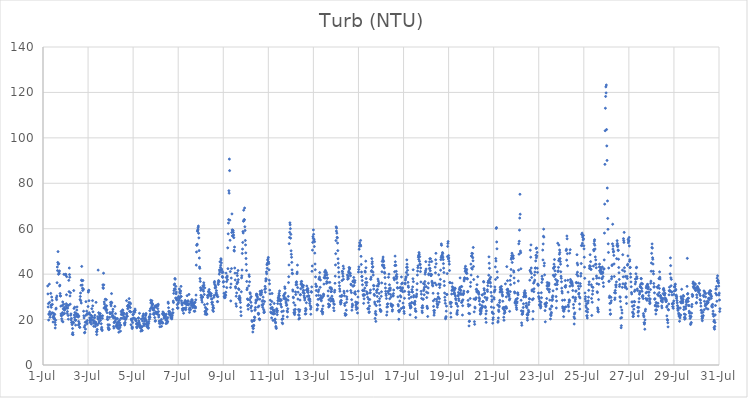
| Category | Turb (NTU) |
|---|---|
| 44378.208333333336 | 34.8 |
| 44378.21875 | 31.29 |
| 44378.229166666664 | 25.55 |
| 44378.239583333336 | 27.02 |
| 44378.25 | 19.78 |
| 44378.260416666664 | 22.27 |
| 44378.270833333336 | 22.65 |
| 44378.28125 | 35.6 |
| 44378.291666666664 | 27.56 |
| 44378.302083333336 | 23.44 |
| 44378.3125 | 21.02 |
| 44378.322916666664 | 22.27 |
| 44378.333333333336 | 22.18 |
| 44378.34375 | 31.53 |
| 44378.354166666664 | 26.29 |
| 44378.364583333336 | 25.41 |
| 44378.375 | 26.37 |
| 44378.385416666664 | 29.91 |
| 44378.395833333336 | 22.83 |
| 44378.40625 | 28.46 |
| 44378.416666666664 | 26.69 |
| 44378.427083333336 | 22.96 |
| 44378.4375 | 21.03 |
| 44378.447916666664 | 18.92 |
| 44378.458333333336 | 21.08 |
| 44378.46875 | 22.72 |
| 44378.479166666664 | 21.85 |
| 44378.489583333336 | 20.97 |
| 44378.5 | 20.44 |
| 44378.510416666664 | 20.25 |
| 44378.520833333336 | 22.32 |
| 44378.53125 | 18.75 |
| 44378.541666666664 | 16.3 |
| 44378.552083333336 | 17.69 |
| 44378.5625 | 19.72 |
| 44378.572916666664 | 24.61 |
| 44378.583333333336 | 25.02 |
| 44378.59375 | 29.55 |
| 44378.604166666664 | 28.76 |
| 44378.614583333336 | 30.36 |
| 44378.625 | 36.23 |
| 44378.635416666664 | 43.13 |
| 44378.645833333336 | 41.56 |
| 44378.65625 | 45.14 |
| 44378.666666666664 | 49.92 |
| 44378.677083333336 | 44.37 |
| 44378.6875 | 39.94 |
| 44378.697916666664 | 44.6 |
| 44378.708333333336 | 40.92 |
| 44378.71875 | 40.28 |
| 44378.729166666664 | 41.4 |
| 44378.739583333336 | 34.79 |
| 44378.75 | 35.16 |
| 44378.760416666664 | 31.47 |
| 44378.770833333336 | 30.39 |
| 44378.78125 | 30.43 |
| 44378.791666666664 | 25.91 |
| 44378.802083333336 | 22.5 |
| 44378.8125 | 21.73 |
| 44378.822916666664 | 21.69 |
| 44378.833333333336 | 20.36 |
| 44378.84375 | 19.43 |
| 44378.854166666664 | 26.18 |
| 44378.864583333336 | 23.06 |
| 44378.875 | 27.76 |
| 44378.885416666664 | 18.99 |
| 44378.895833333336 | 24.69 |
| 44378.90625 | 22.31 |
| 44378.916666666664 | 26.76 |
| 44378.927083333336 | 39.92 |
| 44378.9375 | 25.36 |
| 44378.947916666664 | 24.13 |
| 44378.958333333336 | 22.71 |
| 44378.96875 | 24.73 |
| 44378.979166666664 | 24.59 |
| 44378.989583333336 | 24.68 |
| 44379.0 | 39.63 |
| 44379.010416666664 | 39.96 |
| 44379.020833333336 | 26.01 |
| 44379.03125 | 26.96 |
| 44379.041666666664 | 30.92 |
| 44379.052083333336 | 38.9 |
| 44379.0625 | 25.27 |
| 44379.072916666664 | 22.69 |
| 44379.083333333336 | 23.54 |
| 44379.09375 | 25.02 |
| 44379.104166666664 | 26.34 |
| 44379.114583333336 | 21.8 |
| 44379.125 | 20.18 |
| 44379.135416666664 | 26.22 |
| 44379.145833333336 | 37.27 |
| 44379.15625 | 32.29 |
| 44379.166666666664 | 42.69 |
| 44379.177083333336 | 39.8 |
| 44379.1875 | 38.61 |
| 44379.197916666664 | 30.39 |
| 44379.208333333336 | 26.79 |
| 44379.21875 | 31.79 |
| 44379.229166666664 | 21.95 |
| 44379.239583333336 | 22.51 |
| 44379.25 | 19.78 |
| 44379.260416666664 | 20.54 |
| 44379.270833333336 | 18.64 |
| 44379.28125 | 18.84 |
| 44379.291666666664 | 17.76 |
| 44379.302083333336 | 13.54 |
| 44379.3125 | 16.07 |
| 44379.322916666664 | 14.2 |
| 44379.333333333336 | 13.33 |
| 44379.34375 | 18.87 |
| 44379.354166666664 | 18.56 |
| 44379.364583333336 | 32.77 |
| 44379.375 | 24.91 |
| 44379.385416666664 | 22.01 |
| 44379.395833333336 | 20.9 |
| 44379.40625 | 25.45 |
| 44379.416666666664 | 23.09 |
| 44379.427083333336 | 19.9 |
| 44379.4375 | 19.72 |
| 44379.447916666664 | 17.57 |
| 44379.458333333336 | 19.69 |
| 44379.46875 | 21.41 |
| 44379.479166666664 | 22.37 |
| 44379.489583333336 | 22.61 |
| 44379.5 | 24.18 |
| 44379.510416666664 | 25.57 |
| 44379.520833333336 | 22.24 |
| 44379.53125 | 21.34 |
| 44379.541666666664 | 22.28 |
| 44379.552083333336 | 21.59 |
| 44379.5625 | 21.07 |
| 44379.572916666664 | 17.57 |
| 44379.583333333336 | 19.13 |
| 44379.59375 | 21.54 |
| 44379.604166666664 | 18.01 |
| 44379.614583333336 | 18.33 |
| 44379.625 | 16.65 |
| 44379.635416666664 | 16.56 |
| 44379.645833333336 | 28.82 |
| 44379.65625 | 30.16 |
| 44379.666666666664 | 31.69 |
| 44379.677083333336 | 28.26 |
| 44379.6875 | 35.1 |
| 44379.697916666664 | 27.29 |
| 44379.708333333336 | 37.35 |
| 44379.71875 | 43.41 |
| 44379.729166666664 | 37.06 |
| 44379.739583333336 | 35.2 |
| 44379.75 | 33.78 |
| 44379.760416666664 | 32.8 |
| 44379.770833333336 | 37.22 |
| 44379.78125 | 33.52 |
| 44379.791666666664 | 33.23 |
| 44379.802083333336 | 23.67 |
| 44379.8125 | 21.65 |
| 44379.822916666664 | 20.71 |
| 44379.833333333336 | 16.63 |
| 44379.84375 | 14.18 |
| 44379.854166666664 | 14.37 |
| 44379.864583333336 | 17.42 |
| 44379.875 | 18.79 |
| 44379.885416666664 | 15.8 |
| 44379.895833333336 | 21.84 |
| 44379.90625 | 27.89 |
| 44379.916666666664 | 19.05 |
| 44379.927083333336 | 18.92 |
| 44379.9375 | 23.7 |
| 44379.947916666664 | 22.43 |
| 44379.958333333336 | 18.16 |
| 44379.96875 | 19.58 |
| 44379.979166666664 | 22.58 |
| 44379.989583333336 | 22.42 |
| 44380.0 | 25.74 |
| 44380.010416666664 | 32.09 |
| 44380.020833333336 | 32.68 |
| 44380.03125 | 32.9 |
| 44380.041666666664 | 28.31 |
| 44380.052083333336 | 22.99 |
| 44380.0625 | 22.45 |
| 44380.072916666664 | 20.73 |
| 44380.083333333336 | 18.77 |
| 44380.09375 | 19.83 |
| 44380.104166666664 | 19.79 |
| 44380.114583333336 | 18.94 |
| 44380.125 | 21.87 |
| 44380.135416666664 | 20.66 |
| 44380.145833333336 | 18.01 |
| 44380.15625 | 21.68 |
| 44380.166666666664 | 24.8 |
| 44380.177083333336 | 19.83 |
| 44380.1875 | 21.05 |
| 44380.197916666664 | 28.34 |
| 44380.208333333336 | 26.03 |
| 44380.21875 | 23.43 |
| 44380.229166666664 | 19.63 |
| 44380.239583333336 | 18.5 |
| 44380.25 | 17.06 |
| 44380.260416666664 | 19.1 |
| 44380.270833333336 | 20.88 |
| 44380.28125 | 19.3 |
| 44380.291666666664 | 20.82 |
| 44380.302083333336 | 21.86 |
| 44380.3125 | 18.6 |
| 44380.322916666664 | 16.94 |
| 44380.333333333336 | 17.93 |
| 44380.34375 | 18.85 |
| 44380.354166666664 | 27.58 |
| 44380.364583333336 | 18.18 |
| 44380.375 | 14.63 |
| 44380.385416666664 | 13.4 |
| 44380.395833333336 | 14.85 |
| 44380.40625 | 15.68 |
| 44380.416666666664 | 17.59 |
| 44380.427083333336 | 21.21 |
| 44380.4375 | 20.44 |
| 44380.447916666664 | 41.78 |
| 44380.458333333336 | 20.04 |
| 44380.46875 | 23.02 |
| 44380.479166666664 | 18.36 |
| 44380.489583333336 | 18.96 |
| 44380.5 | 22.48 |
| 44380.510416666664 | 20.73 |
| 44380.520833333336 | 21.75 |
| 44380.53125 | 21.07 |
| 44380.541666666664 | 22.64 |
| 44380.552083333336 | 19.63 |
| 44380.5625 | 20.51 |
| 44380.572916666664 | 21.61 |
| 44380.583333333336 | 18.17 |
| 44380.59375 | 15.79 |
| 44380.604166666664 | 16.59 |
| 44380.614583333336 | 15.6 |
| 44380.625 | 15.17 |
| 44380.635416666664 | 20.57 |
| 44380.645833333336 | 21.69 |
| 44380.65625 | 35.25 |
| 44380.666666666664 | 34.09 |
| 44380.677083333336 | 33.72 |
| 44380.6875 | 40.41 |
| 44380.697916666664 | 35.28 |
| 44380.708333333336 | 25.07 |
| 44380.71875 | 27.77 |
| 44380.729166666664 | 26.82 |
| 44380.739583333336 | 25.01 |
| 44380.75 | 25.49 |
| 44380.760416666664 | 28.97 |
| 44380.770833333336 | 25.8 |
| 44380.78125 | 25.42 |
| 44380.791666666664 | 24.66 |
| 44380.802083333336 | 23.97 |
| 44380.8125 | 28.75 |
| 44380.822916666664 | 26.09 |
| 44380.833333333336 | 24.31 |
| 44380.84375 | 23.04 |
| 44380.854166666664 | 20.16 |
| 44380.864583333336 | 21.12 |
| 44380.875 | 20.01 |
| 44380.885416666664 | 17.74 |
| 44380.895833333336 | 16.55 |
| 44380.90625 | 16 |
| 44380.916666666664 | 15.57 |
| 44380.927083333336 | 16.02 |
| 44380.9375 | 15.73 |
| 44380.947916666664 | 17.63 |
| 44380.958333333336 | 20.96 |
| 44380.96875 | 23.12 |
| 44380.979166666664 | 22.62 |
| 44380.989583333336 | 22.65 |
| 44381.0 | 27.55 |
| 44381.010416666664 | 26.77 |
| 44381.020833333336 | 26.03 |
| 44381.03125 | 27.67 |
| 44381.041666666664 | 31.43 |
| 44381.052083333336 | 27.39 |
| 44381.0625 | 22.79 |
| 44381.072916666664 | 21.3 |
| 44381.083333333336 | 21.85 |
| 44381.09375 | 23.54 |
| 44381.104166666664 | 24.56 |
| 44381.114583333336 | 21.59 |
| 44381.125 | 20.7 |
| 44381.135416666664 | 16.97 |
| 44381.145833333336 | 16.25 |
| 44381.15625 | 18.66 |
| 44381.166666666664 | 20.88 |
| 44381.177083333336 | 19 |
| 44381.1875 | 25.81 |
| 44381.197916666664 | 19.21 |
| 44381.208333333336 | 20.81 |
| 44381.21875 | 22.61 |
| 44381.229166666664 | 20.31 |
| 44381.239583333336 | 20.07 |
| 44381.25 | 17.2 |
| 44381.260416666664 | 16.85 |
| 44381.270833333336 | 17.97 |
| 44381.28125 | 18.49 |
| 44381.291666666664 | 17.37 |
| 44381.302083333336 | 20.47 |
| 44381.3125 | 16.25 |
| 44381.322916666664 | 17.01 |
| 44381.333333333336 | 19.07 |
| 44381.34375 | 18.54 |
| 44381.354166666664 | 16.03 |
| 44381.364583333336 | 14.44 |
| 44381.375 | 17.57 |
| 44381.385416666664 | 16.17 |
| 44381.395833333336 | 19.71 |
| 44381.40625 | 18.57 |
| 44381.416666666664 | 16.67 |
| 44381.427083333336 | 17.55 |
| 44381.4375 | 14.92 |
| 44381.447916666664 | 17.51 |
| 44381.458333333336 | 20.54 |
| 44381.46875 | 23.59 |
| 44381.479166666664 | 22.18 |
| 44381.489583333336 | 22.43 |
| 44381.5 | 23.1 |
| 44381.510416666664 | 20.56 |
| 44381.520833333336 | 22.52 |
| 44381.53125 | 24.25 |
| 44381.541666666664 | 24.04 |
| 44381.552083333336 | 22.05 |
| 44381.5625 | 22.29 |
| 44381.572916666664 | 22.98 |
| 44381.583333333336 | 22.68 |
| 44381.59375 | 21.27 |
| 44381.604166666664 | 20.39 |
| 44381.614583333336 | 18.37 |
| 44381.625 | 17.63 |
| 44381.635416666664 | 18.07 |
| 44381.645833333336 | 18.74 |
| 44381.65625 | 20 |
| 44381.666666666664 | 20.7 |
| 44381.677083333336 | 20.25 |
| 44381.6875 | 20.44 |
| 44381.697916666664 | 22.24 |
| 44381.708333333336 | 28.33 |
| 44381.71875 | 22.75 |
| 44381.729166666664 | 21.48 |
| 44381.739583333336 | 21.48 |
| 44381.75 | 25.9 |
| 44381.760416666664 | 24.74 |
| 44381.770833333336 | 26.13 |
| 44381.78125 | 26.34 |
| 44381.791666666664 | 25.43 |
| 44381.802083333336 | 26.12 |
| 44381.8125 | 27.5 |
| 44381.822916666664 | 29.21 |
| 44381.833333333336 | 25.86 |
| 44381.84375 | 23.63 |
| 44381.854166666664 | 23.61 |
| 44381.864583333336 | 27.4 |
| 44381.875 | 25.27 |
| 44381.885416666664 | 26.94 |
| 44381.895833333336 | 23.33 |
| 44381.90625 | 17.74 |
| 44381.916666666664 | 20.27 |
| 44381.927083333336 | 20 |
| 44381.9375 | 19.53 |
| 44381.947916666664 | 16.71 |
| 44381.958333333336 | 16.06 |
| 44381.96875 | 16.63 |
| 44381.979166666664 | 18.7 |
| 44381.989583333336 | 22.14 |
| 44382.0 | 20.49 |
| 44382.010416666664 | 22.29 |
| 44382.020833333336 | 23.4 |
| 44382.03125 | 20.74 |
| 44382.041666666664 | 23.47 |
| 44382.052083333336 | 23.79 |
| 44382.0625 | 23.63 |
| 44382.072916666664 | 23.18 |
| 44382.083333333336 | 24.65 |
| 44382.09375 | 24.08 |
| 44382.104166666664 | 19.86 |
| 44382.114583333336 | 20.28 |
| 44382.125 | 19.36 |
| 44382.135416666664 | 19.67 |
| 44382.145833333336 | 18.04 |
| 44382.15625 | 16.77 |
| 44382.166666666664 | 16.37 |
| 44382.177083333336 | 18.08 |
| 44382.1875 | 18.25 |
| 44382.197916666664 | 18.47 |
| 44382.208333333336 | 17 |
| 44382.21875 | 17.95 |
| 44382.229166666664 | 20.61 |
| 44382.239583333336 | 20.73 |
| 44382.25 | 17.9 |
| 44382.260416666664 | 19.36 |
| 44382.270833333336 | 18.55 |
| 44382.28125 | 22.75 |
| 44382.291666666664 | 17.84 |
| 44382.302083333336 | 17.12 |
| 44382.3125 | 16.45 |
| 44382.322916666664 | 16.98 |
| 44382.333333333336 | 16.5 |
| 44382.34375 | 14.9 |
| 44382.354166666664 | 16.35 |
| 44382.364583333336 | 20.27 |
| 44382.375 | 15.38 |
| 44382.385416666664 | 16.87 |
| 44382.395833333336 | 16.81 |
| 44382.40625 | 15.16 |
| 44382.416666666664 | 19.39 |
| 44382.427083333336 | 21.54 |
| 44382.4375 | 20.56 |
| 44382.447916666664 | 21.57 |
| 44382.458333333336 | 22.44 |
| 44382.46875 | 18.2 |
| 44382.479166666664 | 17.33 |
| 44382.489583333336 | 17.98 |
| 44382.5 | 20.32 |
| 44382.510416666664 | 19.29 |
| 44382.520833333336 | 20.15 |
| 44382.53125 | 18.01 |
| 44382.541666666664 | 20.65 |
| 44382.552083333336 | 21.72 |
| 44382.5625 | 22.12 |
| 44382.572916666664 | 22.67 |
| 44382.583333333336 | 19.69 |
| 44382.59375 | 17.82 |
| 44382.604166666664 | 16.97 |
| 44382.614583333336 | 18.81 |
| 44382.625 | 18.03 |
| 44382.635416666664 | 16.96 |
| 44382.645833333336 | 16.93 |
| 44382.65625 | 17.44 |
| 44382.666666666664 | 16.21 |
| 44382.677083333336 | 16.4 |
| 44382.6875 | 18.25 |
| 44382.697916666664 | 19.11 |
| 44382.708333333336 | 21.05 |
| 44382.71875 | 20.15 |
| 44382.729166666664 | 21.41 |
| 44382.739583333336 | 23.9 |
| 44382.75 | 20.95 |
| 44382.760416666664 | 22.37 |
| 44382.770833333336 | 24.81 |
| 44382.78125 | 28.51 |
| 44382.791666666664 | 27.26 |
| 44382.802083333336 | 27.61 |
| 44382.8125 | 25.42 |
| 44382.822916666664 | 27.44 |
| 44382.833333333336 | 28.3 |
| 44382.84375 | 26.17 |
| 44382.854166666664 | 26.82 |
| 44382.864583333336 | 26.8 |
| 44382.875 | 24.35 |
| 44382.885416666664 | 24.97 |
| 44382.895833333336 | 25.04 |
| 44382.90625 | 22.35 |
| 44382.916666666664 | 22.83 |
| 44382.927083333336 | 24.08 |
| 44382.9375 | 22.31 |
| 44382.947916666664 | 25.29 |
| 44382.958333333336 | 20.87 |
| 44382.96875 | 25.97 |
| 44382.979166666664 | 19.26 |
| 44382.989583333336 | 19.53 |
| 44383.0 | 23.05 |
| 44383.010416666664 | 23.34 |
| 44383.020833333336 | 25.44 |
| 44383.03125 | 26.29 |
| 44383.041666666664 | 25.9 |
| 44383.052083333336 | 22.62 |
| 44383.0625 | 23.08 |
| 44383.072916666664 | 23.25 |
| 44383.083333333336 | 22.35 |
| 44383.09375 | 24.81 |
| 44383.104166666664 | 26.08 |
| 44383.114583333336 | 26.76 |
| 44383.125 | 23.53 |
| 44383.135416666664 | 21.12 |
| 44383.145833333336 | 22.01 |
| 44383.15625 | 19.32 |
| 44383.166666666664 | 18.3 |
| 44383.177083333336 | 19.08 |
| 44383.1875 | 16.82 |
| 44383.197916666664 | 18.59 |
| 44383.208333333336 | 19.23 |
| 44383.21875 | 18.34 |
| 44383.229166666664 | 19.1 |
| 44383.239583333336 | 19.25 |
| 44383.25 | 20.01 |
| 44383.260416666664 | 17.02 |
| 44383.270833333336 | 18.97 |
| 44383.28125 | 18.68 |
| 44383.291666666664 | 18.86 |
| 44383.302083333336 | 22.54 |
| 44383.3125 | 18.42 |
| 44383.322916666664 | 23.38 |
| 44383.333333333336 | 22.41 |
| 44383.34375 | 22.05 |
| 44383.354166666664 | 22.78 |
| 44383.364583333336 | 20.64 |
| 44383.375 | 22.55 |
| 44383.385416666664 | 21.46 |
| 44383.395833333336 | 20.91 |
| 44383.40625 | 21.67 |
| 44383.416666666664 | 21.39 |
| 44383.427083333336 | 21.88 |
| 44383.4375 | 21.29 |
| 44383.447916666664 | 19.83 |
| 44383.458333333336 | 18.23 |
| 44383.46875 | 22.36 |
| 44383.479166666664 | 20.41 |
| 44383.489583333336 | 19.93 |
| 44383.5 | 18.91 |
| 44383.510416666664 | 18.5 |
| 44383.520833333336 | 19.18 |
| 44383.53125 | 19.12 |
| 44383.541666666664 | 20.87 |
| 44383.552083333336 | 27.68 |
| 44383.5625 | 27.14 |
| 44383.572916666664 | 25.22 |
| 44383.583333333336 | 23.63 |
| 44383.59375 | 22.49 |
| 44383.604166666664 | 23.2 |
| 44383.614583333336 | 22.19 |
| 44383.625 | 23.51 |
| 44383.635416666664 | 22.24 |
| 44383.645833333336 | 22.43 |
| 44383.65625 | 21.74 |
| 44383.666666666664 | 22.44 |
| 44383.677083333336 | 21.06 |
| 44383.6875 | 20.56 |
| 44383.697916666664 | 21.13 |
| 44383.708333333336 | 20.64 |
| 44383.71875 | 20.28 |
| 44383.729166666664 | 21.13 |
| 44383.739583333336 | 21.93 |
| 44383.75 | 22.95 |
| 44383.760416666664 | 24.45 |
| 44383.770833333336 | 22.98 |
| 44383.78125 | 28.14 |
| 44383.791666666664 | 27.48 |
| 44383.802083333336 | 31.54 |
| 44383.8125 | 32.76 |
| 44383.822916666664 | 35.29 |
| 44383.833333333336 | 33.56 |
| 44383.84375 | 35.69 |
| 44383.854166666664 | 38.07 |
| 44383.864583333336 | 37.78 |
| 44383.875 | 33.36 |
| 44383.885416666664 | 29.49 |
| 44383.895833333336 | 34.6 |
| 44383.90625 | 31.34 |
| 44383.916666666664 | 32.11 |
| 44383.927083333336 | 28.91 |
| 44383.9375 | 28.59 |
| 44383.947916666664 | 29.54 |
| 44383.958333333336 | 26.58 |
| 44383.96875 | 25.21 |
| 44383.979166666664 | 24.97 |
| 44383.989583333336 | 25.17 |
| 44384.0 | 27.02 |
| 44384.010416666664 | 27.65 |
| 44384.020833333336 | 30.21 |
| 44384.03125 | 28.47 |
| 44384.041666666664 | 29.56 |
| 44384.052083333336 | 33.45 |
| 44384.0625 | 29.23 |
| 44384.072916666664 | 31.91 |
| 44384.083333333336 | 32.39 |
| 44384.09375 | 31.55 |
| 44384.104166666664 | 32.64 |
| 44384.114583333336 | 30.1 |
| 44384.125 | 34.62 |
| 44384.135416666664 | 30.18 |
| 44384.145833333336 | 28.22 |
| 44384.15625 | 27.34 |
| 44384.166666666664 | 26.88 |
| 44384.177083333336 | 26.41 |
| 44384.1875 | 24.75 |
| 44384.197916666664 | 24.01 |
| 44384.208333333336 | 24.68 |
| 44384.21875 | 24.65 |
| 44384.229166666664 | 24.38 |
| 44384.239583333336 | 22.78 |
| 44384.25 | 24.85 |
| 44384.260416666664 | 24.95 |
| 44384.270833333336 | 27.39 |
| 44384.28125 | 27.33 |
| 44384.291666666664 | 27.79 |
| 44384.302083333336 | 27.2 |
| 44384.3125 | 28.42 |
| 44384.322916666664 | 27.3 |
| 44384.333333333336 | 24.35 |
| 44384.34375 | 25.21 |
| 44384.354166666664 | 26.87 |
| 44384.364583333336 | 26.88 |
| 44384.375 | 26.49 |
| 44384.385416666664 | 27.85 |
| 44384.395833333336 | 30.51 |
| 44384.40625 | 26.88 |
| 44384.416666666664 | 27.85 |
| 44384.427083333336 | 26.73 |
| 44384.4375 | 28.31 |
| 44384.447916666664 | 26.47 |
| 44384.458333333336 | 26.66 |
| 44384.46875 | 26.85 |
| 44384.479166666664 | 31.08 |
| 44384.489583333336 | 24.41 |
| 44384.5 | 23.16 |
| 44384.510416666664 | 24.94 |
| 44384.520833333336 | 25.15 |
| 44384.53125 | 24.22 |
| 44384.541666666664 | 24.55 |
| 44384.552083333336 | 27.86 |
| 44384.5625 | 27.44 |
| 44384.572916666664 | 26.99 |
| 44384.583333333336 | 26.12 |
| 44384.59375 | 27.44 |
| 44384.604166666664 | 28.77 |
| 44384.614583333336 | 27.62 |
| 44384.625 | 28.52 |
| 44384.635416666664 | 26.9 |
| 44384.645833333336 | 25.26 |
| 44384.65625 | 25.69 |
| 44384.666666666664 | 27.4 |
| 44384.677083333336 | 26.22 |
| 44384.6875 | 26.38 |
| 44384.697916666664 | 25.88 |
| 44384.708333333336 | 23.69 |
| 44384.71875 | 27.3 |
| 44384.729166666664 | 25.36 |
| 44384.739583333336 | 23.67 |
| 44384.75 | 27.63 |
| 44384.760416666664 | 25.67 |
| 44384.770833333336 | 25.14 |
| 44384.78125 | 28.68 |
| 44384.791666666664 | 30.78 |
| 44384.802083333336 | 43.97 |
| 44384.8125 | 49.76 |
| 44384.822916666664 | 52.68 |
| 44384.833333333336 | 52.88 |
| 44384.84375 | 53.18 |
| 44384.854166666664 | 58.86 |
| 44384.864583333336 | 59.2 |
| 44384.875 | 59.67 |
| 44384.885416666664 | 60.51 |
| 44384.895833333336 | 61.17 |
| 44384.90625 | 57.99 |
| 44384.916666666664 | 55.96 |
| 44384.927083333336 | 50.36 |
| 44384.9375 | 47.08 |
| 44384.947916666664 | 43.14 |
| 44384.958333333336 | 42.56 |
| 44384.96875 | 38.04 |
| 44384.979166666664 | 36.81 |
| 44384.989583333336 | 34 |
| 44385.0 | 32.89 |
| 44385.010416666664 | 30.7 |
| 44385.020833333336 | 29.71 |
| 44385.03125 | 33.42 |
| 44385.041666666664 | 28.6 |
| 44385.052083333336 | 29.62 |
| 44385.0625 | 27.66 |
| 44385.072916666664 | 30.04 |
| 44385.083333333336 | 29.84 |
| 44385.09375 | 34.82 |
| 44385.104166666664 | 33.2 |
| 44385.114583333336 | 34.41 |
| 44385.125 | 32.49 |
| 44385.135416666664 | 36.19 |
| 44385.145833333336 | 35.17 |
| 44385.15625 | 31.06 |
| 44385.166666666664 | 26.56 |
| 44385.177083333336 | 33.98 |
| 44385.1875 | 23.59 |
| 44385.197916666664 | 22.36 |
| 44385.208333333336 | 25.35 |
| 44385.21875 | 23.26 |
| 44385.229166666664 | 23.73 |
| 44385.239583333336 | 24.81 |
| 44385.25 | 22.39 |
| 44385.260416666664 | 22.61 |
| 44385.270833333336 | 22.3 |
| 44385.28125 | 24.51 |
| 44385.291666666664 | 26.92 |
| 44385.302083333336 | 30.5 |
| 44385.3125 | 29.68 |
| 44385.322916666664 | 30.82 |
| 44385.333333333336 | 30.66 |
| 44385.34375 | 32.4 |
| 44385.354166666664 | 32.24 |
| 44385.364583333336 | 32.09 |
| 44385.375 | 33.21 |
| 44385.385416666664 | 32.12 |
| 44385.395833333336 | 31.59 |
| 44385.40625 | 31.14 |
| 44385.416666666664 | 30.84 |
| 44385.427083333336 | 30.92 |
| 44385.4375 | 30.31 |
| 44385.447916666664 | 30.8 |
| 44385.458333333336 | 30.52 |
| 44385.46875 | 31.43 |
| 44385.479166666664 | 29.03 |
| 44385.489583333336 | 27.52 |
| 44385.5 | 29.13 |
| 44385.510416666664 | 26.72 |
| 44385.520833333336 | 27.66 |
| 44385.53125 | 24.17 |
| 44385.541666666664 | 25.31 |
| 44385.552083333336 | 26.02 |
| 44385.5625 | 23.59 |
| 44385.572916666664 | 25 |
| 44385.583333333336 | 29.8 |
| 44385.59375 | 30.6 |
| 44385.604166666664 | 36.2 |
| 44385.614583333336 | 36.77 |
| 44385.625 | 35.38 |
| 44385.635416666664 | 33.94 |
| 44385.645833333336 | 33.91 |
| 44385.65625 | 34.82 |
| 44385.666666666664 | 34.2 |
| 44385.677083333336 | 31.24 |
| 44385.6875 | 31.85 |
| 44385.697916666664 | 32.74 |
| 44385.708333333336 | 30.62 |
| 44385.71875 | 31.04 |
| 44385.729166666664 | 30.29 |
| 44385.739583333336 | 27.92 |
| 44385.75 | 27.91 |
| 44385.760416666664 | 30.06 |
| 44385.770833333336 | 36.08 |
| 44385.78125 | 35.46 |
| 44385.791666666664 | 37.19 |
| 44385.802083333336 | 36.82 |
| 44385.8125 | 36.77 |
| 44385.822916666664 | 39.99 |
| 44385.833333333336 | 41.83 |
| 44385.84375 | 40.96 |
| 44385.854166666664 | 45.42 |
| 44385.864583333336 | 41.88 |
| 44385.875 | 43 |
| 44385.885416666664 | 43.92 |
| 44385.895833333336 | 46.79 |
| 44385.90625 | 46.23 |
| 44385.916666666664 | 44.95 |
| 44385.927083333336 | 42.23 |
| 44385.9375 | 41.64 |
| 44385.947916666664 | 40.68 |
| 44385.958333333336 | 38.99 |
| 44385.96875 | 38.59 |
| 44385.979166666664 | 38.72 |
| 44385.989583333336 | 40.8 |
| 44386.0 | 36.41 |
| 44386.010416666664 | 36.8 |
| 44386.020833333336 | 34.51 |
| 44386.03125 | 31.6 |
| 44386.041666666664 | 30.09 |
| 44386.052083333336 | 29.64 |
| 44386.0625 | 30.33 |
| 44386.072916666664 | 30.78 |
| 44386.083333333336 | 29.69 |
| 44386.09375 | 30.97 |
| 44386.104166666664 | 30.57 |
| 44386.114583333336 | 32.06 |
| 44386.125 | 40.44 |
| 44386.135416666664 | 38.52 |
| 44386.145833333336 | 36.71 |
| 44386.15625 | 34.07 |
| 44386.166666666664 | 38.65 |
| 44386.177083333336 | 39.15 |
| 44386.1875 | 37.57 |
| 44386.197916666664 | 51.57 |
| 44386.208333333336 | 42.41 |
| 44386.21875 | 57.74 |
| 44386.229166666664 | 62.5 |
| 44386.239583333336 | 64.01 |
| 44386.25 | 76.72 |
| 44386.260416666664 | 75.65 |
| 44386.270833333336 | 90.67 |
| 44386.28125 | 85.58 |
| 44386.291666666664 | 63.75 |
| 44386.302083333336 | 54.92 |
| 44386.3125 | 41.12 |
| 44386.322916666664 | 34.13 |
| 44386.333333333336 | 28.21 |
| 44386.34375 | 35.66 |
| 44386.354166666664 | 38.28 |
| 44386.364583333336 | 42.43 |
| 44386.375 | 58.35 |
| 44386.385416666664 | 66.51 |
| 44386.395833333336 | 59.49 |
| 44386.40625 | 56.88 |
| 44386.416666666664 | 59.31 |
| 44386.427083333336 | 56.77 |
| 44386.4375 | 59.2 |
| 44386.447916666664 | 58.37 |
| 44386.458333333336 | 57.21 |
| 44386.46875 | 56.05 |
| 44386.479166666664 | 50.49 |
| 44386.489583333336 | 50.15 |
| 44386.5 | 51.93 |
| 44386.510416666664 | 42.69 |
| 44386.520833333336 | 40.44 |
| 44386.53125 | 37.45 |
| 44386.541666666664 | 34.48 |
| 44386.552083333336 | 33.92 |
| 44386.5625 | 26.95 |
| 44386.572916666664 | 30.27 |
| 44386.583333333336 | 25.87 |
| 44386.59375 | 31.73 |
| 44386.604166666664 | 35.74 |
| 44386.614583333336 | 40.41 |
| 44386.625 | 39.34 |
| 44386.635416666664 | 36.51 |
| 44386.645833333336 | 36.38 |
| 44386.65625 | 41.59 |
| 44386.666666666664 | 37.58 |
| 44386.677083333336 | 33.6 |
| 44386.6875 | 29.28 |
| 44386.697916666664 | 33.21 |
| 44386.708333333336 | 29.23 |
| 44386.71875 | 30.35 |
| 44386.729166666664 | 28.83 |
| 44386.739583333336 | 28.51 |
| 44386.75 | 29.5 |
| 44386.760416666664 | 27.54 |
| 44386.770833333336 | 25.32 |
| 44386.78125 | 23.45 |
| 44386.791666666664 | 21.73 |
| 44386.802083333336 | 32.23 |
| 44386.8125 | 38.36 |
| 44386.822916666664 | 39.26 |
| 44386.833333333336 | 41.82 |
| 44386.84375 | 49.12 |
| 44386.854166666664 | 51.03 |
| 44386.864583333336 | 53.95 |
| 44386.875 | 58.75 |
| 44386.885416666664 | 58.13 |
| 44386.895833333336 | 63.29 |
| 44386.90625 | 68.15 |
| 44386.916666666664 | 63.5 |
| 44386.927083333336 | 63.95 |
| 44386.9375 | 63.99 |
| 44386.947916666664 | 69.11 |
| 44386.958333333336 | 60.86 |
| 44386.96875 | 59.24 |
| 44386.979166666664 | 54.82 |
| 44386.989583333336 | 52.87 |
| 44387.0 | 49.36 |
| 44387.010416666664 | 46.89 |
| 44387.020833333336 | 44.3 |
| 44387.03125 | 41.63 |
| 44387.041666666664 | 36.78 |
| 44387.052083333336 | 33.15 |
| 44387.0625 | 33.88 |
| 44387.072916666664 | 29.09 |
| 44387.083333333336 | 26.08 |
| 44387.09375 | 28.77 |
| 44387.104166666664 | 24.54 |
| 44387.114583333336 | 26.56 |
| 44387.125 | 26.45 |
| 44387.135416666664 | 34.85 |
| 44387.145833333336 | 39.71 |
| 44387.15625 | 38.96 |
| 44387.166666666664 | 36.63 |
| 44387.177083333336 | 28.57 |
| 44387.1875 | 31.82 |
| 44387.197916666664 | 31.3 |
| 44387.208333333336 | 29.54 |
| 44387.21875 | 25.17 |
| 44387.229166666664 | 27.58 |
| 44387.239583333336 | 30.1 |
| 44387.25 | 25.95 |
| 44387.260416666664 | 23.81 |
| 44387.270833333336 | 19.54 |
| 44387.28125 | 19.15 |
| 44387.291666666664 | 17.07 |
| 44387.302083333336 | 17.01 |
| 44387.3125 | 14.53 |
| 44387.322916666664 | 16.27 |
| 44387.333333333336 | 16.04 |
| 44387.34375 | 17.22 |
| 44387.354166666664 | 17.48 |
| 44387.364583333336 | 19.49 |
| 44387.375 | 19.79 |
| 44387.385416666664 | 21.09 |
| 44387.395833333336 | 20.86 |
| 44387.40625 | 24.06 |
| 44387.416666666664 | 24.4 |
| 44387.427083333336 | 25.32 |
| 44387.4375 | 27.33 |
| 44387.447916666664 | 28.6 |
| 44387.458333333336 | 28.13 |
| 44387.46875 | 31.22 |
| 44387.479166666664 | 30.57 |
| 44387.489583333336 | 30.46 |
| 44387.5 | 31.05 |
| 44387.510416666664 | 28.81 |
| 44387.520833333336 | 29.9 |
| 44387.53125 | 28.95 |
| 44387.541666666664 | 25.5 |
| 44387.552083333336 | 22.76 |
| 44387.5625 | 22.27 |
| 44387.572916666664 | 22.63 |
| 44387.583333333336 | 25.96 |
| 44387.59375 | 20.27 |
| 44387.604166666664 | 20.27 |
| 44387.614583333336 | 19.93 |
| 44387.625 | 28.95 |
| 44387.635416666664 | 32.47 |
| 44387.645833333336 | 31.29 |
| 44387.65625 | 30.84 |
| 44387.666666666664 | 31.94 |
| 44387.677083333336 | 31.44 |
| 44387.6875 | 30.96 |
| 44387.697916666664 | 31.93 |
| 44387.708333333336 | 32.71 |
| 44387.71875 | 26.46 |
| 44387.729166666664 | 28.01 |
| 44387.739583333336 | 26.2 |
| 44387.75 | 25.36 |
| 44387.760416666664 | 28.36 |
| 44387.770833333336 | 29.88 |
| 44387.78125 | 26.87 |
| 44387.791666666664 | 24.42 |
| 44387.802083333336 | 23.07 |
| 44387.8125 | 23.73 |
| 44387.822916666664 | 23.23 |
| 44387.833333333336 | 27.96 |
| 44387.84375 | 33.29 |
| 44387.854166666664 | 34.64 |
| 44387.864583333336 | 32.05 |
| 44387.875 | 33.69 |
| 44387.885416666664 | 37 |
| 44387.895833333336 | 38.01 |
| 44387.90625 | 37.67 |
| 44387.916666666664 | 40.99 |
| 44387.927083333336 | 40.15 |
| 44387.9375 | 44.13 |
| 44387.947916666664 | 42.56 |
| 44387.958333333336 | 44.69 |
| 44387.96875 | 46.24 |
| 44387.979166666664 | 44.98 |
| 44387.989583333336 | 46.64 |
| 44388.0 | 47.36 |
| 44388.010416666664 | 45.4 |
| 44388.020833333336 | 44.65 |
| 44388.03125 | 41.91 |
| 44388.041666666664 | 37.33 |
| 44388.052083333336 | 35.73 |
| 44388.0625 | 32.97 |
| 44388.072916666664 | 31.34 |
| 44388.083333333336 | 28.52 |
| 44388.09375 | 26.64 |
| 44388.104166666664 | 23.29 |
| 44388.114583333336 | 24.89 |
| 44388.125 | 25.17 |
| 44388.135416666664 | 22.82 |
| 44388.145833333336 | 20.74 |
| 44388.15625 | 27.95 |
| 44388.166666666664 | 31.49 |
| 44388.177083333336 | 25.32 |
| 44388.1875 | 22.97 |
| 44388.197916666664 | 24.37 |
| 44388.208333333336 | 19.63 |
| 44388.21875 | 22.45 |
| 44388.229166666664 | 22.65 |
| 44388.239583333336 | 23.87 |
| 44388.25 | 24.21 |
| 44388.260416666664 | 27.09 |
| 44388.270833333336 | 23.65 |
| 44388.28125 | 22.59 |
| 44388.291666666664 | 19.93 |
| 44388.302083333336 | 20.19 |
| 44388.3125 | 18.92 |
| 44388.322916666664 | 18.53 |
| 44388.333333333336 | 16.98 |
| 44388.34375 | 16.48 |
| 44388.354166666664 | 16.09 |
| 44388.364583333336 | 24.26 |
| 44388.375 | 24.76 |
| 44388.385416666664 | 23.21 |
| 44388.395833333336 | 22.16 |
| 44388.40625 | 23.9 |
| 44388.416666666664 | 27.03 |
| 44388.427083333336 | 28.32 |
| 44388.4375 | 29.48 |
| 44388.447916666664 | 29.81 |
| 44388.458333333336 | 28.64 |
| 44388.46875 | 30.68 |
| 44388.479166666664 | 31.55 |
| 44388.489583333336 | 30.5 |
| 44388.5 | 32.58 |
| 44388.510416666664 | 29.08 |
| 44388.520833333336 | 28.19 |
| 44388.53125 | 28.35 |
| 44388.541666666664 | 26.95 |
| 44388.552083333336 | 26.49 |
| 44388.5625 | 28.59 |
| 44388.572916666664 | 28.57 |
| 44388.583333333336 | 25.54 |
| 44388.59375 | 23.48 |
| 44388.604166666664 | 20.09 |
| 44388.614583333336 | 18.58 |
| 44388.625 | 20.28 |
| 44388.635416666664 | 18.19 |
| 44388.645833333336 | 20.33 |
| 44388.65625 | 21.58 |
| 44388.666666666664 | 23.76 |
| 44388.677083333336 | 30.52 |
| 44388.6875 | 29.42 |
| 44388.697916666664 | 30.31 |
| 44388.708333333336 | 31.16 |
| 44388.71875 | 29.11 |
| 44388.729166666664 | 34.39 |
| 44388.739583333336 | 33.71 |
| 44388.75 | 31.72 |
| 44388.760416666664 | 29.43 |
| 44388.770833333336 | 28.88 |
| 44388.78125 | 27.74 |
| 44388.791666666664 | 27.24 |
| 44388.802083333336 | 26.24 |
| 44388.8125 | 28.83 |
| 44388.822916666664 | 26.42 |
| 44388.833333333336 | 23.8 |
| 44388.84375 | 21.17 |
| 44388.854166666664 | 23.35 |
| 44388.864583333336 | 24.77 |
| 44388.875 | 28.53 |
| 44388.885416666664 | 30.21 |
| 44388.895833333336 | 36.28 |
| 44388.90625 | 38.87 |
| 44388.916666666664 | 44.04 |
| 44388.927083333336 | 53.42 |
| 44388.9375 | 56.16 |
| 44388.947916666664 | 58.39 |
| 44388.958333333336 | 62.59 |
| 44388.96875 | 61.71 |
| 44388.979166666664 | 60.03 |
| 44388.989583333336 | 55.83 |
| 44389.0 | 57.53 |
| 44389.010416666664 | 50.28 |
| 44389.020833333336 | 48.73 |
| 44389.03125 | 47.43 |
| 44389.041666666664 | 45.18 |
| 44389.052083333336 | 41.89 |
| 44389.0625 | 40.38 |
| 44389.072916666664 | 40.2 |
| 44389.083333333336 | 33.05 |
| 44389.09375 | 32.5 |
| 44389.104166666664 | 29.89 |
| 44389.114583333336 | 29.59 |
| 44389.125 | 27.43 |
| 44389.135416666664 | 23.07 |
| 44389.145833333336 | 24.28 |
| 44389.15625 | 22.71 |
| 44389.166666666664 | 22.2 |
| 44389.177083333336 | 23.24 |
| 44389.1875 | 26.34 |
| 44389.197916666664 | 24.48 |
| 44389.208333333336 | 32.17 |
| 44389.21875 | 31.03 |
| 44389.229166666664 | 35.26 |
| 44389.239583333336 | 36.22 |
| 44389.25 | 36.65 |
| 44389.260416666664 | 35.43 |
| 44389.270833333336 | 40.19 |
| 44389.28125 | 40.9 |
| 44389.291666666664 | 43.98 |
| 44389.302083333336 | 34.08 |
| 44389.3125 | 29.04 |
| 44389.322916666664 | 32.05 |
| 44389.333333333336 | 24.4 |
| 44389.34375 | 22.1 |
| 44389.354166666664 | 20.2 |
| 44389.364583333336 | 21.88 |
| 44389.375 | 23.47 |
| 44389.385416666664 | 20.63 |
| 44389.395833333336 | 24.29 |
| 44389.40625 | 28.58 |
| 44389.416666666664 | 30.9 |
| 44389.427083333336 | 31.01 |
| 44389.4375 | 33.58 |
| 44389.447916666664 | 35.59 |
| 44389.458333333336 | 36.66 |
| 44389.46875 | 35.85 |
| 44389.479166666664 | 36.82 |
| 44389.489583333336 | 35.5 |
| 44389.5 | 35.17 |
| 44389.510416666664 | 34.68 |
| 44389.520833333336 | 34.48 |
| 44389.53125 | 34.16 |
| 44389.541666666664 | 31.94 |
| 44389.552083333336 | 32.8 |
| 44389.5625 | 35 |
| 44389.572916666664 | 32.8 |
| 44389.583333333336 | 30.51 |
| 44389.59375 | 31.6 |
| 44389.604166666664 | 29.62 |
| 44389.614583333336 | 28.6 |
| 44389.625 | 29.53 |
| 44389.635416666664 | 22.43 |
| 44389.645833333336 | 23.79 |
| 44389.65625 | 24.89 |
| 44389.666666666664 | 22.54 |
| 44389.677083333336 | 24.36 |
| 44389.6875 | 27.41 |
| 44389.697916666664 | 32.97 |
| 44389.708333333336 | 34.77 |
| 44389.71875 | 33.23 |
| 44389.729166666664 | 30.23 |
| 44389.739583333336 | 32.14 |
| 44389.75 | 33.69 |
| 44389.760416666664 | 32.86 |
| 44389.770833333336 | 31.94 |
| 44389.78125 | 30.49 |
| 44389.791666666664 | 28.69 |
| 44389.802083333336 | 30.39 |
| 44389.8125 | 29.28 |
| 44389.822916666664 | 29.15 |
| 44389.833333333336 | 27.1 |
| 44389.84375 | 28.98 |
| 44389.854166666664 | 28.08 |
| 44389.864583333336 | 26.09 |
| 44389.875 | 24.64 |
| 44389.885416666664 | 22.35 |
| 44389.895833333336 | 25.47 |
| 44389.90625 | 32.34 |
| 44389.916666666664 | 32.03 |
| 44389.927083333336 | 34.38 |
| 44389.9375 | 41.25 |
| 44389.947916666664 | 43.59 |
| 44389.958333333336 | 50.56 |
| 44389.96875 | 53.97 |
| 44389.979166666664 | 56.57 |
| 44389.989583333336 | 55.86 |
| 44390.0 | 59.46 |
| 44390.010416666664 | 57.55 |
| 44390.020833333336 | 54.94 |
| 44390.03125 | 55.38 |
| 44390.041666666664 | 52.15 |
| 44390.052083333336 | 54.28 |
| 44390.0625 | 49.26 |
| 44390.072916666664 | 44.47 |
| 44390.083333333336 | 41.93 |
| 44390.09375 | 38.77 |
| 44390.104166666664 | 35.62 |
| 44390.114583333336 | 34.6 |
| 44390.125 | 32.8 |
| 44390.135416666664 | 30.58 |
| 44390.145833333336 | 34.61 |
| 44390.15625 | 24.18 |
| 44390.166666666664 | 26.59 |
| 44390.177083333336 | 24.68 |
| 44390.1875 | 26.47 |
| 44390.197916666664 | 26.29 |
| 44390.208333333336 | 28.89 |
| 44390.21875 | 32.23 |
| 44390.229166666664 | 30.69 |
| 44390.239583333336 | 33.11 |
| 44390.25 | 37.77 |
| 44390.260416666664 | 38.12 |
| 44390.270833333336 | 38.69 |
| 44390.28125 | 40.69 |
| 44390.291666666664 | 29.23 |
| 44390.302083333336 | 34.21 |
| 44390.3125 | 37.43 |
| 44390.322916666664 | 30.5 |
| 44390.333333333336 | 28.67 |
| 44390.34375 | 29.65 |
| 44390.354166666664 | 28.27 |
| 44390.364583333336 | 23.69 |
| 44390.375 | 23.58 |
| 44390.385416666664 | 29.52 |
| 44390.395833333336 | 24.66 |
| 44390.40625 | 22.5 |
| 44390.416666666664 | 23.29 |
| 44390.427083333336 | 26.02 |
| 44390.4375 | 30.23 |
| 44390.447916666664 | 31.22 |
| 44390.458333333336 | 30.86 |
| 44390.46875 | 35.62 |
| 44390.479166666664 | 38.54 |
| 44390.489583333336 | 38.34 |
| 44390.5 | 40.97 |
| 44390.510416666664 | 39.59 |
| 44390.520833333336 | 40.86 |
| 44390.53125 | 41.67 |
| 44390.541666666664 | 39.4 |
| 44390.552083333336 | 38.3 |
| 44390.5625 | 40.46 |
| 44390.572916666664 | 40.83 |
| 44390.583333333336 | 35.94 |
| 44390.59375 | 36.7 |
| 44390.604166666664 | 39.78 |
| 44390.614583333336 | 38.19 |
| 44390.625 | 38.33 |
| 44390.635416666664 | 36.31 |
| 44390.645833333336 | 30.4 |
| 44390.65625 | 32.6 |
| 44390.666666666664 | 26.86 |
| 44390.677083333336 | 25.54 |
| 44390.6875 | 28.69 |
| 44390.697916666664 | 26.43 |
| 44390.708333333336 | 25.87 |
| 44390.71875 | 26.44 |
| 44390.729166666664 | 36.38 |
| 44390.739583333336 | 34.09 |
| 44390.75 | 33.74 |
| 44390.760416666664 | 29.38 |
| 44390.770833333336 | 28.11 |
| 44390.78125 | 32.26 |
| 44390.791666666664 | 33.94 |
| 44390.802083333336 | 32.41 |
| 44390.8125 | 33.36 |
| 44390.822916666664 | 30.32 |
| 44390.833333333336 | 29.1 |
| 44390.84375 | 28.31 |
| 44390.854166666664 | 29.04 |
| 44390.864583333336 | 28.68 |
| 44390.875 | 28.29 |
| 44390.885416666664 | 27.96 |
| 44390.895833333336 | 25.13 |
| 44390.90625 | 26.95 |
| 44390.916666666664 | 23.9 |
| 44390.927083333336 | 26.69 |
| 44390.9375 | 32.09 |
| 44390.947916666664 | 32.9 |
| 44390.958333333336 | 35.97 |
| 44390.96875 | 39.11 |
| 44390.979166666664 | 44.05 |
| 44390.989583333336 | 49.01 |
| 44391.0 | 54.78 |
| 44391.010416666664 | 60.81 |
| 44391.020833333336 | 58.96 |
| 44391.03125 | 60.27 |
| 44391.041666666664 | 58.04 |
| 44391.052083333336 | 56.2 |
| 44391.0625 | 55.97 |
| 44391.072916666664 | 53.69 |
| 44391.083333333336 | 50.35 |
| 44391.09375 | 46.76 |
| 44391.104166666664 | 44.81 |
| 44391.114583333336 | 42.88 |
| 44391.125 | 40.82 |
| 44391.135416666664 | 38.74 |
| 44391.145833333336 | 36.31 |
| 44391.15625 | 34.84 |
| 44391.166666666664 | 33.49 |
| 44391.177083333336 | 32.49 |
| 44391.1875 | 30.26 |
| 44391.197916666664 | 27.66 |
| 44391.208333333336 | 26.84 |
| 44391.21875 | 28.27 |
| 44391.229166666664 | 27.4 |
| 44391.239583333336 | 28.4 |
| 44391.25 | 30.2 |
| 44391.260416666664 | 30.65 |
| 44391.270833333336 | 37.19 |
| 44391.28125 | 41.29 |
| 44391.291666666664 | 41.06 |
| 44391.302083333336 | 40.2 |
| 44391.3125 | 39.06 |
| 44391.322916666664 | 43.53 |
| 44391.333333333336 | 37.75 |
| 44391.34375 | 42.47 |
| 44391.354166666664 | 32.49 |
| 44391.364583333336 | 31.68 |
| 44391.375 | 30.49 |
| 44391.385416666664 | 26.99 |
| 44391.395833333336 | 26.2 |
| 44391.40625 | 22.65 |
| 44391.416666666664 | 21.85 |
| 44391.427083333336 | 22.12 |
| 44391.4375 | 22.21 |
| 44391.447916666664 | 22.08 |
| 44391.458333333336 | 24.13 |
| 44391.46875 | 27.57 |
| 44391.479166666664 | 30.01 |
| 44391.489583333336 | 28.99 |
| 44391.5 | 32.55 |
| 44391.510416666664 | 39.62 |
| 44391.520833333336 | 37.76 |
| 44391.53125 | 38.61 |
| 44391.541666666664 | 39 |
| 44391.552083333336 | 38.07 |
| 44391.5625 | 40.88 |
| 44391.572916666664 | 41.36 |
| 44391.583333333336 | 42.91 |
| 44391.59375 | 40.51 |
| 44391.604166666664 | 42.25 |
| 44391.614583333336 | 42.74 |
| 44391.625 | 40.16 |
| 44391.635416666664 | 40.45 |
| 44391.645833333336 | 39.29 |
| 44391.65625 | 32.77 |
| 44391.666666666664 | 35.6 |
| 44391.677083333336 | 35.27 |
| 44391.6875 | 31.86 |
| 44391.697916666664 | 28.76 |
| 44391.708333333336 | 24.11 |
| 44391.71875 | 25.54 |
| 44391.729166666664 | 26.83 |
| 44391.739583333336 | 26.24 |
| 44391.75 | 36.79 |
| 44391.760416666664 | 34.64 |
| 44391.770833333336 | 37.12 |
| 44391.78125 | 36.62 |
| 44391.791666666664 | 38.54 |
| 44391.802083333336 | 34.98 |
| 44391.8125 | 37.12 |
| 44391.822916666664 | 31.63 |
| 44391.833333333336 | 36.29 |
| 44391.84375 | 37.13 |
| 44391.854166666664 | 32.25 |
| 44391.864583333336 | 31.17 |
| 44391.875 | 27.69 |
| 44391.885416666664 | 26.37 |
| 44391.895833333336 | 25.5 |
| 44391.90625 | 24.45 |
| 44391.916666666664 | 27.52 |
| 44391.927083333336 | 26.91 |
| 44391.9375 | 25.13 |
| 44391.947916666664 | 25.01 |
| 44391.958333333336 | 22.91 |
| 44391.96875 | 27.39 |
| 44391.979166666664 | 29.91 |
| 44391.989583333336 | 32.52 |
| 44392.0 | 40.93 |
| 44392.010416666664 | 42.08 |
| 44392.020833333336 | 43.2 |
| 44392.03125 | 50.98 |
| 44392.041666666664 | 52.31 |
| 44392.052083333336 | 53.79 |
| 44392.0625 | 52.54 |
| 44392.072916666664 | 52.84 |
| 44392.083333333336 | 52.91 |
| 44392.09375 | 54.84 |
| 44392.104166666664 | 52.37 |
| 44392.114583333336 | 47.83 |
| 44392.125 | 44.27 |
| 44392.135416666664 | 40.94 |
| 44392.145833333336 | 38.89 |
| 44392.15625 | 38.96 |
| 44392.166666666664 | 37.18 |
| 44392.177083333336 | 35.32 |
| 44392.1875 | 32.9 |
| 44392.197916666664 | 32.71 |
| 44392.208333333336 | 30.94 |
| 44392.21875 | 30.51 |
| 44392.229166666664 | 27.14 |
| 44392.239583333336 | 30.99 |
| 44392.25 | 29.13 |
| 44392.260416666664 | 32.75 |
| 44392.270833333336 | 30.81 |
| 44392.28125 | 33.85 |
| 44392.291666666664 | 41.31 |
| 44392.302083333336 | 40.91 |
| 44392.3125 | 36.28 |
| 44392.322916666664 | 45.72 |
| 44392.333333333336 | 42.82 |
| 44392.34375 | 38.04 |
| 44392.354166666664 | 35.11 |
| 44392.364583333336 | 32.22 |
| 44392.375 | 36.34 |
| 44392.385416666664 | 31.26 |
| 44392.395833333336 | 31.56 |
| 44392.40625 | 29.8 |
| 44392.416666666664 | 24.75 |
| 44392.427083333336 | 24.83 |
| 44392.4375 | 27.45 |
| 44392.447916666664 | 28.95 |
| 44392.458333333336 | 24.76 |
| 44392.46875 | 23.1 |
| 44392.479166666664 | 23.44 |
| 44392.489583333336 | 25.94 |
| 44392.5 | 28.85 |
| 44392.510416666664 | 31.77 |
| 44392.520833333336 | 31.79 |
| 44392.53125 | 32.99 |
| 44392.541666666664 | 37.8 |
| 44392.552083333336 | 37.77 |
| 44392.5625 | 38.7 |
| 44392.572916666664 | 41.19 |
| 44392.583333333336 | 41.55 |
| 44392.59375 | 46.85 |
| 44392.604166666664 | 44.6 |
| 44392.614583333336 | 45.45 |
| 44392.625 | 43.05 |
| 44392.635416666664 | 43.32 |
| 44392.645833333336 | 40.89 |
| 44392.65625 | 39.61 |
| 44392.666666666664 | 35.03 |
| 44392.677083333336 | 33.41 |
| 44392.6875 | 34.85 |
| 44392.697916666664 | 31.13 |
| 44392.708333333336 | 30.63 |
| 44392.71875 | 27.71 |
| 44392.729166666664 | 26.89 |
| 44392.739583333336 | 20.5 |
| 44392.75 | 22.73 |
| 44392.760416666664 | 23.58 |
| 44392.770833333336 | 19.2 |
| 44392.78125 | 22.1 |
| 44392.791666666664 | 26.16 |
| 44392.802083333336 | 32.73 |
| 44392.8125 | 31.93 |
| 44392.822916666664 | 34.84 |
| 44392.833333333336 | 30.19 |
| 44392.84375 | 33.27 |
| 44392.854166666664 | 28 |
| 44392.864583333336 | 37.83 |
| 44392.875 | 34.75 |
| 44392.885416666664 | 36.93 |
| 44392.895833333336 | 35.61 |
| 44392.90625 | 35.98 |
| 44392.916666666664 | 31.52 |
| 44392.927083333336 | 28.05 |
| 44392.9375 | 29.2 |
| 44392.947916666664 | 26.37 |
| 44392.958333333336 | 24.5 |
| 44392.96875 | 24.22 |
| 44392.979166666664 | 23.96 |
| 44392.989583333336 | 23.54 |
| 44393.0 | 23.85 |
| 44393.010416666664 | 30.26 |
| 44393.020833333336 | 32.24 |
| 44393.03125 | 36.15 |
| 44393.041666666664 | 41.05 |
| 44393.052083333336 | 45.62 |
| 44393.0625 | 44.04 |
| 44393.072916666664 | 43.71 |
| 44393.083333333336 | 46.62 |
| 44393.09375 | 47.53 |
| 44393.104166666664 | 45.82 |
| 44393.114583333336 | 45.58 |
| 44393.125 | 43.94 |
| 44393.135416666664 | 42.97 |
| 44393.145833333336 | 42.72 |
| 44393.15625 | 40.79 |
| 44393.166666666664 | 40.38 |
| 44393.177083333336 | 38.49 |
| 44393.1875 | 35.72 |
| 44393.197916666664 | 33.93 |
| 44393.208333333336 | 32.43 |
| 44393.21875 | 31.35 |
| 44393.229166666664 | 30.61 |
| 44393.239583333336 | 29.27 |
| 44393.25 | 21.97 |
| 44393.260416666664 | 25.49 |
| 44393.270833333336 | 23.37 |
| 44393.28125 | 26.76 |
| 44393.291666666664 | 25.64 |
| 44393.302083333336 | 26.94 |
| 44393.3125 | 32.35 |
| 44393.322916666664 | 32.32 |
| 44393.333333333336 | 38.62 |
| 44393.34375 | 31.4 |
| 44393.354166666664 | 40 |
| 44393.364583333336 | 33.63 |
| 44393.375 | 35.31 |
| 44393.385416666664 | 29.17 |
| 44393.395833333336 | 32.93 |
| 44393.40625 | 33.04 |
| 44393.416666666664 | 33.86 |
| 44393.427083333336 | 31.03 |
| 44393.4375 | 26.92 |
| 44393.447916666664 | 29.95 |
| 44393.458333333336 | 26.12 |
| 44393.46875 | 26.64 |
| 44393.479166666664 | 26.31 |
| 44393.489583333336 | 25.71 |
| 44393.5 | 23.72 |
| 44393.510416666664 | 24.33 |
| 44393.520833333336 | 26.29 |
| 44393.53125 | 30.55 |
| 44393.541666666664 | 30.39 |
| 44393.552083333336 | 31.44 |
| 44393.5625 | 33.01 |
| 44393.572916666664 | 38.38 |
| 44393.583333333336 | 38.03 |
| 44393.59375 | 37.5 |
| 44393.604166666664 | 41.05 |
| 44393.614583333336 | 43.8 |
| 44393.625 | 47.94 |
| 44393.635416666664 | 45.44 |
| 44393.645833333336 | 43.88 |
| 44393.65625 | 43.86 |
| 44393.666666666664 | 39.06 |
| 44393.677083333336 | 41.24 |
| 44393.6875 | 37.95 |
| 44393.697916666664 | 39.87 |
| 44393.708333333336 | 38.8 |
| 44393.71875 | 36.19 |
| 44393.729166666664 | 34.08 |
| 44393.739583333336 | 33.85 |
| 44393.75 | 29.99 |
| 44393.760416666664 | 26.61 |
| 44393.770833333336 | 26 |
| 44393.78125 | 23.9 |
| 44393.791666666664 | 20.16 |
| 44393.802083333336 | 23.37 |
| 44393.8125 | 23.99 |
| 44393.822916666664 | 23.93 |
| 44393.83347222222 | 28.16 |
| 44393.84375 | 33.99 |
| 44393.854166666664 | 30.51 |
| 44393.864583333336 | 34.2 |
| 44393.875 | 32.76 |
| 44393.885416666664 | 29.94 |
| 44393.895833333336 | 24.87 |
| 44393.90625 | 38.76 |
| 44393.916666666664 | 35.73 |
| 44393.927083333336 | 32.66 |
| 44393.9375 | 33.51 |
| 44393.947916666664 | 36.09 |
| 44393.958333333336 | 33.96 |
| 44393.96875 | 32.27 |
| 44393.979166666664 | 27.26 |
| 44393.989583333336 | 25.11 |
| 44394.0 | 25.6 |
| 44394.010416666664 | 25.15 |
| 44394.020833333336 | 23.59 |
| 44394.03125 | 22.72 |
| 44394.041666666664 | 29.36 |
| 44394.052083333336 | 32.46 |
| 44394.0625 | 36 |
| 44394.072916666664 | 35.71 |
| 44394.083333333336 | 37.36 |
| 44394.09375 | 37.96 |
| 44394.104166666664 | 38.79 |
| 44394.114583333336 | 38.7 |
| 44394.125 | 40.73 |
| 44394.135416666664 | 42.99 |
| 44394.145833333336 | 46.28 |
| 44394.15625 | 44.38 |
| 44394.166666666664 | 43.04 |
| 44394.177083333336 | 41.69 |
| 44394.1875 | 39.74 |
| 44394.197916666664 | 36.38 |
| 44394.208333333336 | 34.79 |
| 44394.21875 | 34.2 |
| 44394.229166666664 | 32.18 |
| 44394.239583333336 | 30.98 |
| 44394.25 | 29.32 |
| 44394.260416666664 | 32.02 |
| 44394.270833333336 | 26.95 |
| 44394.28125 | 26.13 |
| 44394.291666666664 | 22.1 |
| 44394.302083333336 | 25.09 |
| 44394.3125 | 25.82 |
| 44394.322916666664 | 25.87 |
| 44394.333333333336 | 25.37 |
| 44394.34375 | 29.92 |
| 44394.354166666664 | 27.21 |
| 44394.364583333336 | 27.55 |
| 44394.375 | 33.19 |
| 44394.385416666664 | 32.22 |
| 44394.395833333336 | 32.13 |
| 44394.40625 | 34.39 |
| 44394.416666666664 | 37.98 |
| 44394.427083333336 | 41.93 |
| 44394.4375 | 36.7 |
| 44394.447916666664 | 29.92 |
| 44394.458333333336 | 30.59 |
| 44394.46875 | 27.34 |
| 44394.479166666664 | 27.04 |
| 44394.489583333336 | 27.32 |
| 44394.5 | 26.65 |
| 44394.510416666664 | 28.07 |
| 44394.520833333336 | 24.73 |
| 44394.53125 | 23.79 |
| 44394.541666666664 | 20.92 |
| 44394.552083333336 | 23.6 |
| 44394.5625 | 29.94 |
| 44394.572916666664 | 30.36 |
| 44394.583333333336 | 31.23 |
| 44394.59375 | 33.06 |
| 44394.604166666664 | 35.82 |
| 44394.614583333336 | 39.6 |
| 44394.625 | 41.37 |
| 44394.635416666664 | 42.83 |
| 44394.645833333336 | 43.69 |
| 44394.65625 | 47.49 |
| 44394.666666666664 | 48.21 |
| 44394.677083333336 | 46.51 |
| 44394.6875 | 49.5 |
| 44394.697916666664 | 48.79 |
| 44394.708333333336 | 45.66 |
| 44394.71875 | 47.69 |
| 44394.729166666664 | 44.49 |
| 44394.739583333336 | 44.19 |
| 44394.75 | 41.13 |
| 44394.760416666664 | 42.73 |
| 44394.770833333336 | 36.55 |
| 44394.78125 | 32.44 |
| 44394.791666666664 | 31.18 |
| 44394.802083333336 | 29.32 |
| 44394.8125 | 25.28 |
| 44394.822916666664 | 23.79 |
| 44394.833333333336 | 23.05 |
| 44394.84375 | 26.13 |
| 44394.854166666664 | 25.25 |
| 44394.864583333336 | 28.9 |
| 44394.875 | 29.01 |
| 44394.885416666664 | 35.88 |
| 44394.895833333336 | 32.78 |
| 44394.90625 | 33.36 |
| 44394.916666666664 | 30.91 |
| 44394.927083333336 | 34.21 |
| 44394.9375 | 35.46 |
| 44394.947916666664 | 36.74 |
| 44394.958333333336 | 39.98 |
| 44394.96875 | 40.78 |
| 44394.979166666664 | 41.47 |
| 44394.989583333336 | 45.5 |
| 44395.0 | 42.25 |
| 44395.010416666664 | 34.53 |
| 44395.020833333336 | 32.05 |
| 44395.03125 | 29.69 |
| 44395.041666666664 | 25.87 |
| 44395.052083333336 | 25.14 |
| 44395.0625 | 24.9 |
| 44395.072916666664 | 21.37 |
| 44395.083333333336 | 31.71 |
| 44395.09375 | 33.92 |
| 44395.104166666664 | 36 |
| 44395.114583333336 | 39.75 |
| 44395.125 | 40.18 |
| 44395.135416666664 | 44.02 |
| 44395.145833333336 | 42.45 |
| 44395.15625 | 45.39 |
| 44395.166666666664 | 46.79 |
| 44395.177083333336 | 42.55 |
| 44395.1875 | 41.49 |
| 44395.197916666664 | 46.8 |
| 44395.208333333336 | 39.76 |
| 44395.21875 | 39.3 |
| 44395.229166666664 | 39.87 |
| 44395.239583333336 | 39.83 |
| 44395.25 | 45.58 |
| 44395.260416666664 | 36.89 |
| 44395.270833333336 | 36.34 |
| 44395.28125 | 35.19 |
| 44395.291666666664 | 35.94 |
| 44395.302083333336 | 34.79 |
| 44395.3125 | 31.59 |
| 44395.322916666664 | 28.24 |
| 44395.333333333336 | 25.79 |
| 44395.34375 | 23.93 |
| 44395.354166666664 | 21.93 |
| 44395.364583333336 | 22.94 |
| 44395.375 | 24 |
| 44395.385416666664 | 28.9 |
| 44395.395833333336 | 36.1 |
| 44395.40625 | 43.09 |
| 44395.416666666664 | 40.59 |
| 44395.427083333336 | 46.31 |
| 44395.4375 | 49.17 |
| 44395.447916666664 | 44.58 |
| 44395.458333333336 | 35.25 |
| 44395.46875 | 28.95 |
| 44395.479166666664 | 27.98 |
| 44395.489583333336 | 26.94 |
| 44395.5 | 25.45 |
| 44395.510416666664 | 26.43 |
| 44395.520833333336 | 26.7 |
| 44395.53125 | 31.49 |
| 44395.541666666664 | 29.95 |
| 44395.552083333336 | 29.6 |
| 44395.5625 | 39.71 |
| 44395.572916666664 | 35.64 |
| 44395.583333333336 | 27.7 |
| 44395.59375 | 29.2 |
| 44395.604166666664 | 34.11 |
| 44395.614583333336 | 35.18 |
| 44395.625 | 35.58 |
| 44395.635416666664 | 37.7 |
| 44395.645833333336 | 41.74 |
| 44395.65625 | 46.41 |
| 44395.666666666664 | 47.48 |
| 44395.677083333336 | 53.3 |
| 44395.6875 | 52.7 |
| 44395.697916666664 | 48.25 |
| 44395.708333333336 | 47.33 |
| 44395.71875 | 48.38 |
| 44395.729166666664 | 49.49 |
| 44395.739583333336 | 49.12 |
| 44395.75 | 47.52 |
| 44395.760416666664 | 46.42 |
| 44395.770833333336 | 44.63 |
| 44395.78125 | 42.64 |
| 44395.791666666664 | 40.71 |
| 44395.802083333336 | 36.83 |
| 44395.8125 | 34.98 |
| 44395.822916666664 | 31.69 |
| 44395.833333333336 | 29.84 |
| 44395.84375 | 28.47 |
| 44395.854166666664 | 27.15 |
| 44395.864583333336 | 20.35 |
| 44395.875 | 20.84 |
| 44395.885416666664 | 21.3 |
| 44395.895833333336 | 23.71 |
| 44395.90625 | 25.93 |
| 44395.916666666664 | 31.03 |
| 44395.927083333336 | 31.09 |
| 44395.9375 | 40.23 |
| 44395.947916666664 | 47.73 |
| 44395.958333333336 | 52.21 |
| 44395.96875 | 53.53 |
| 44395.979166666664 | 54.35 |
| 44395.989583333336 | 46.66 |
| 44396.0 | 48.18 |
| 44396.010416666664 | 47.12 |
| 44396.020833333336 | 45.62 |
| 44396.03125 | 44.39 |
| 44396.041666666664 | 41.59 |
| 44396.052083333336 | 36.3 |
| 44396.0625 | 36.23 |
| 44396.072916666664 | 27.6 |
| 44396.083333333336 | 26.92 |
| 44396.09375 | 22.85 |
| 44396.104166666664 | 21.06 |
| 44396.114583333336 | 25.68 |
| 44396.125 | 27.47 |
| 44396.135416666664 | 31.24 |
| 44396.145833333336 | 32.82 |
| 44396.15625 | 36.05 |
| 44396.166666666664 | 34.46 |
| 44396.177083333336 | 32.99 |
| 44396.1875 | 33.46 |
| 44396.197916666664 | 33.97 |
| 44396.208333333336 | 33.38 |
| 44396.21875 | 33.61 |
| 44396.229166666664 | 33.57 |
| 44396.239583333336 | 31.53 |
| 44396.25 | 32.67 |
| 44396.260416666664 | 31.71 |
| 44396.270833333336 | 31.06 |
| 44396.28125 | 33.89 |
| 44396.291666666664 | 33.59 |
| 44396.302083333336 | 30.36 |
| 44396.3125 | 29.28 |
| 44396.322916666664 | 28.72 |
| 44396.333333333336 | 27.33 |
| 44396.34375 | 27.03 |
| 44396.354166666664 | 26.8 |
| 44396.364583333336 | 22.49 |
| 44396.375 | 23.26 |
| 44396.385416666664 | 22.29 |
| 44396.395833333336 | 24.03 |
| 44396.40625 | 25.83 |
| 44396.416666666664 | 30.59 |
| 44396.427083333336 | 30.4 |
| 44396.4375 | 31.97 |
| 44396.447916666664 | 29.19 |
| 44396.458333333336 | 28.35 |
| 44396.46875 | 31.37 |
| 44396.479166666664 | 33.2 |
| 44396.489583333336 | 33.54 |
| 44396.5 | 34.18 |
| 44396.510416666664 | 38.34 |
| 44396.520833333336 | 33.04 |
| 44396.53125 | 31.61 |
| 44396.541666666664 | 32.79 |
| 44396.552083333336 | 31.05 |
| 44396.5625 | 34.54 |
| 44396.572916666664 | 27.51 |
| 44396.583333333336 | 34.53 |
| 44396.59375 | 27.74 |
| 44396.604166666664 | 28.22 |
| 44396.614583333336 | 21.99 |
| 44396.625 | 26.11 |
| 44396.635416666664 | 28.7 |
| 44396.645833333336 | 30.96 |
| 44396.65625 | 31.4 |
| 44396.666666666664 | 31.61 |
| 44396.677083333336 | 32.53 |
| 44396.6875 | 37 |
| 44396.697916666664 | 37.69 |
| 44396.708333333336 | 38.4 |
| 44396.71875 | 38.15 |
| 44396.729166666664 | 42.51 |
| 44396.739583333336 | 41.19 |
| 44396.75 | 43.45 |
| 44396.760416666664 | 41.61 |
| 44396.770833333336 | 41.49 |
| 44396.78125 | 41.35 |
| 44396.791666666664 | 40.38 |
| 44396.802083333336 | 42.11 |
| 44396.8125 | 40.32 |
| 44396.822916666664 | 38.15 |
| 44396.833333333336 | 37.86 |
| 44396.84375 | 32.11 |
| 44396.854166666664 | 32.38 |
| 44396.864583333336 | 28.43 |
| 44396.875 | 26.68 |
| 44396.885416666664 | 25.9 |
| 44396.895833333336 | 22.75 |
| 44396.90625 | 17.21 |
| 44396.916666666664 | 19.16 |
| 44396.927083333336 | 19.3 |
| 44396.9375 | 22.59 |
| 44396.947916666664 | 26.36 |
| 44396.958333333336 | 29.26 |
| 44396.96875 | 34.58 |
| 44396.979166666664 | 36.39 |
| 44396.989583333336 | 44.41 |
| 44397.0 | 39.6 |
| 44397.010416666664 | 47.99 |
| 44397.020833333336 | 42.66 |
| 44397.03125 | 49.17 |
| 44397.041666666664 | 47.83 |
| 44397.052083333336 | 42.24 |
| 44397.0625 | 49.07 |
| 44397.072916666664 | 47.21 |
| 44397.083333333336 | 45.87 |
| 44397.09375 | 51.75 |
| 44397.104166666664 | 43.38 |
| 44397.114583333336 | 37.62 |
| 44397.125 | 29.08 |
| 44397.135416666664 | 23.39 |
| 44397.145833333336 | 19.09 |
| 44397.15625 | 17.91 |
| 44397.166666666664 | 25.5 |
| 44397.177083333336 | 25.08 |
| 44397.1875 | 28.81 |
| 44397.197916666664 | 29.1 |
| 44397.208333333336 | 29.24 |
| 44397.21875 | 29.62 |
| 44397.229166666664 | 33.18 |
| 44397.239583333336 | 33.36 |
| 44397.25 | 32.21 |
| 44397.260416666664 | 35.35 |
| 44397.270833333336 | 32.15 |
| 44397.28125 | 32.3 |
| 44397.291666666664 | 38.86 |
| 44397.302083333336 | 32.48 |
| 44397.3125 | 32.17 |
| 44397.322916666664 | 31.99 |
| 44397.333333333336 | 31.63 |
| 44397.34375 | 31.1 |
| 44397.354166666664 | 29.69 |
| 44397.364583333336 | 28.17 |
| 44397.375 | 29.1 |
| 44397.385416666664 | 26.62 |
| 44397.395833333336 | 24.12 |
| 44397.40625 | 22.41 |
| 44397.416666666664 | 23.5 |
| 44397.427083333336 | 24.99 |
| 44397.4375 | 22.83 |
| 44397.447916666664 | 23.78 |
| 44397.458333333336 | 24.77 |
| 44397.46875 | 25.05 |
| 44397.479166666664 | 26.13 |
| 44397.489583333336 | 30.85 |
| 44397.5 | 30.9 |
| 44397.510416666664 | 27.85 |
| 44397.520833333336 | 25.67 |
| 44397.53125 | 27.95 |
| 44397.541666666664 | 27.87 |
| 44397.552083333336 | 36.76 |
| 44397.5625 | 36.52 |
| 44397.572916666664 | 33.62 |
| 44397.583333333336 | 32.93 |
| 44397.59375 | 31.36 |
| 44397.604166666664 | 31.72 |
| 44397.614583333336 | 29.76 |
| 44397.625 | 25.75 |
| 44397.635416666664 | 25.26 |
| 44397.645833333336 | 20.45 |
| 44397.65625 | 22.49 |
| 44397.666666666664 | 18.77 |
| 44397.677083333336 | 23.8 |
| 44397.6875 | 28.68 |
| 44397.697916666664 | 29.44 |
| 44397.708333333336 | 29.53 |
| 44397.71875 | 33.11 |
| 44397.729166666664 | 32.38 |
| 44397.739583333336 | 34.92 |
| 44397.75 | 36.32 |
| 44397.760416666664 | 36.37 |
| 44397.770833333336 | 37.09 |
| 44397.78125 | 39.54 |
| 44397.791666666664 | 47.61 |
| 44397.802083333336 | 44.8 |
| 44397.8125 | 42.57 |
| 44397.822916666664 | 37.7 |
| 44397.833333333336 | 37.93 |
| 44397.84375 | 36.5 |
| 44397.854166666664 | 36.09 |
| 44397.864583333336 | 38.62 |
| 44397.875 | 34.57 |
| 44397.885416666664 | 31.97 |
| 44397.895833333336 | 25.51 |
| 44397.90625 | 30.32 |
| 44397.916666666664 | 27.97 |
| 44397.927083333336 | 28.69 |
| 44397.9375 | 23.31 |
| 44397.947916666664 | 22.93 |
| 44397.958333333336 | 18.42 |
| 44397.96875 | 20.01 |
| 44397.979166666664 | 20.82 |
| 44397.989583333336 | 22.57 |
| 44398.0 | 25.21 |
| 44398.010416666664 | 29.67 |
| 44398.020833333336 | 29 |
| 44398.03125 | 32.19 |
| 44398.041666666664 | 32.71 |
| 44398.052083333336 | 34.38 |
| 44398.0625 | 33.14 |
| 44398.072916666664 | 43.19 |
| 44398.083333333336 | 37.67 |
| 44398.09375 | 46.86 |
| 44398.104166666664 | 45.77 |
| 44398.114583333336 | 60.13 |
| 44398.125 | 60.49 |
| 44398.135416666664 | 54.17 |
| 44398.145833333336 | 51.15 |
| 44398.15625 | 41.01 |
| 44398.166666666664 | 38.5 |
| 44398.177083333336 | 26.42 |
| 44398.1875 | 18.81 |
| 44398.197916666664 | 19.28 |
| 44398.208333333336 | 20.71 |
| 44398.21875 | 24.18 |
| 44398.229166666664 | 23.53 |
| 44398.239583333336 | 26.11 |
| 44398.25 | 25.64 |
| 44398.260416666664 | 27.54 |
| 44398.270833333336 | 28.46 |
| 44398.28125 | 32.1 |
| 44398.291666666664 | 34.2 |
| 44398.302083333336 | 33.33 |
| 44398.3125 | 33.12 |
| 44398.322916666664 | 32.48 |
| 44398.333333333336 | 32.96 |
| 44398.34375 | 34.59 |
| 44398.354166666664 | 33.35 |
| 44398.364583333336 | 32.27 |
| 44398.375 | 31.93 |
| 44398.385416666664 | 30.97 |
| 44398.395833333336 | 30.4 |
| 44398.40625 | 28.08 |
| 44398.416666666664 | 24.83 |
| 44398.427083333336 | 25.31 |
| 44398.4375 | 24.9 |
| 44398.447916666664 | 21.03 |
| 44398.458333333336 | 19.68 |
| 44398.46875 | 22.68 |
| 44398.479166666664 | 24.13 |
| 44398.489583333336 | 23.79 |
| 44398.5 | 23.19 |
| 44398.510416666664 | 25.46 |
| 44398.520833333336 | 35.71 |
| 44398.53125 | 25.34 |
| 44398.541666666664 | 25.37 |
| 44398.552083333336 | 25.66 |
| 44398.5625 | 29.99 |
| 44398.572916666664 | 24.97 |
| 44398.583333333336 | 43.3 |
| 44398.59375 | 33.15 |
| 44398.604166666664 | 31.87 |
| 44398.614583333336 | 37.12 |
| 44398.625 | 33.39 |
| 44398.635416666664 | 31.24 |
| 44398.645833333336 | 31.6 |
| 44398.65625 | 32.54 |
| 44398.666666666664 | 30.73 |
| 44398.677083333336 | 30.21 |
| 44398.6875 | 30.96 |
| 44398.697916666664 | 28.65 |
| 44398.708333333336 | 23.62 |
| 44398.71875 | 29.2 |
| 44398.729166666664 | 37.27 |
| 44398.739583333336 | 32.29 |
| 44398.75 | 35.37 |
| 44398.760416666664 | 39.26 |
| 44398.770833333336 | 42.06 |
| 44398.78125 | 46.54 |
| 44398.791666666664 | 47.11 |
| 44398.802083333336 | 48.12 |
| 44398.8125 | 49.21 |
| 44398.822916666664 | 45.15 |
| 44398.833333333336 | 47.4 |
| 44398.84375 | 48.1 |
| 44398.854166666664 | 47.56 |
| 44398.864583333336 | 48.12 |
| 44398.875 | 46.92 |
| 44398.885416666664 | 41.44 |
| 44398.895833333336 | 40.88 |
| 44398.90625 | 38.32 |
| 44398.916666666664 | 36.09 |
| 44398.927083333336 | 32.18 |
| 44398.9375 | 31.7 |
| 44398.947916666664 | 27.59 |
| 44398.958333333336 | 27.14 |
| 44398.96875 | 28.09 |
| 44398.979166666664 | 28.04 |
| 44398.989583333336 | 28.88 |
| 44399.0 | 26.17 |
| 44399.010416666664 | 25.24 |
| 44399.020833333336 | 24.46 |
| 44399.03125 | 27.27 |
| 44399.041666666664 | 27.78 |
| 44399.052083333336 | 29.31 |
| 44399.0625 | 31.62 |
| 44399.072916666664 | 31.74 |
| 44399.083333333336 | 30.92 |
| 44399.09375 | 36.98 |
| 44399.104166666664 | 41.77 |
| 44399.114583333336 | 53.35 |
| 44399.125 | 48.78 |
| 44399.135416666664 | 54.46 |
| 44399.145833333336 | 59.38 |
| 44399.15625 | 64.69 |
| 44399.166666666664 | 75.17 |
| 44399.177083333336 | 66.39 |
| 44399.1875 | 50.15 |
| 44399.197916666664 | 49.4 |
| 44399.208333333336 | 42.36 |
| 44399.21875 | 28.5 |
| 44399.229166666664 | 23.85 |
| 44399.239583333336 | 18.54 |
| 44399.25 | 17.48 |
| 44399.260416666664 | 22.33 |
| 44399.270833333336 | 22.45 |
| 44399.28125 | 22.49 |
| 44399.291666666664 | 23.28 |
| 44399.302083333336 | 23.74 |
| 44399.3125 | 25.32 |
| 44399.322916666664 | 26.95 |
| 44399.333333333336 | 30 |
| 44399.34375 | 30.11 |
| 44399.354166666664 | 31.89 |
| 44399.364583333336 | 31.18 |
| 44399.375 | 30.57 |
| 44399.385416666664 | 32.71 |
| 44399.395833333336 | 31.5 |
| 44399.40625 | 31.76 |
| 44399.416666666664 | 30.62 |
| 44399.427083333336 | 29.98 |
| 44399.4375 | 26 |
| 44399.447916666664 | 27.16 |
| 44399.458333333336 | 25.9 |
| 44399.46875 | 25.24 |
| 44399.479166666664 | 22.22 |
| 44399.489583333336 | 20.69 |
| 44399.5 | 19.71 |
| 44399.510416666664 | 21.94 |
| 44399.520833333336 | 22.27 |
| 44399.53125 | 23.02 |
| 44399.541666666664 | 24.14 |
| 44399.552083333336 | 26.55 |
| 44399.5625 | 23.43 |
| 44399.572916666664 | 27.59 |
| 44399.583333333336 | 29.24 |
| 44399.59375 | 29.06 |
| 44399.604166666664 | 37.34 |
| 44399.614583333336 | 41.68 |
| 44399.625 | 50.54 |
| 44399.635416666664 | 41.07 |
| 44399.645833333336 | 47.47 |
| 44399.65625 | 52.87 |
| 44399.666666666664 | 42.7 |
| 44399.677083333336 | 40.34 |
| 44399.6875 | 38.52 |
| 44399.697916666664 | 32.62 |
| 44399.708333333336 | 33.14 |
| 44399.71875 | 28.75 |
| 44399.729166666664 | 28.89 |
| 44399.739583333336 | 20.21 |
| 44399.75 | 23.61 |
| 44399.760416666664 | 29.19 |
| 44399.770833333336 | 36.03 |
| 44399.78125 | 32.29 |
| 44399.791666666664 | 33.55 |
| 44399.802083333336 | 36.59 |
| 44399.8125 | 39.6 |
| 44399.822916666664 | 37.37 |
| 44399.833333333336 | 40.95 |
| 44399.84375 | 42.65 |
| 44399.854166666664 | 42.7 |
| 44399.864583333336 | 45.81 |
| 44399.875 | 48.29 |
| 44399.885416666664 | 51.3 |
| 44399.895833333336 | 47.2 |
| 44399.90625 | 51.49 |
| 44399.916666666664 | 48.01 |
| 44399.927083333336 | 49.56 |
| 44399.9375 | 42.6 |
| 44399.947916666664 | 40.78 |
| 44399.958333333336 | 35.62 |
| 44399.96875 | 35.46 |
| 44399.979166666664 | 35.03 |
| 44399.989583333336 | 31.68 |
| 44400.0 | 30.15 |
| 44400.010416666664 | 29.78 |
| 44400.020833333336 | 29.14 |
| 44400.03125 | 26.52 |
| 44400.041666666664 | 28.07 |
| 44400.052083333336 | 26.24 |
| 44400.0625 | 26.11 |
| 44400.072916666664 | 26.71 |
| 44400.083333333336 | 25.12 |
| 44400.09375 | 25.78 |
| 44400.104166666664 | 27.6 |
| 44400.114583333336 | 31.8 |
| 44400.125 | 29.63 |
| 44400.135416666664 | 36.36 |
| 44400.145833333336 | 39.08 |
| 44400.15625 | 37.98 |
| 44400.166666666664 | 37.6 |
| 44400.177083333336 | 50.59 |
| 44400.1875 | 46.25 |
| 44400.197916666664 | 53.29 |
| 44400.208333333336 | 56.67 |
| 44400.21875 | 59.81 |
| 44400.229166666664 | 56.31 |
| 44400.239583333336 | 43.66 |
| 44400.25 | 44.85 |
| 44400.260416666664 | 39.68 |
| 44400.270833333336 | 26.85 |
| 44400.28125 | 23.96 |
| 44400.291666666664 | 19.01 |
| 44400.302083333336 | 27.03 |
| 44400.3125 | 25.71 |
| 44400.322916666664 | 26.24 |
| 44400.333333333336 | 27.42 |
| 44400.34375 | 27.17 |
| 44400.354166666664 | 29.26 |
| 44400.364583333336 | 34.81 |
| 44400.375 | 36.3 |
| 44400.385416666664 | 33.6 |
| 44400.395833333336 | 35.02 |
| 44400.40625 | 35.57 |
| 44400.416666666664 | 33.17 |
| 44400.427083333336 | 34.86 |
| 44400.4375 | 34.92 |
| 44400.447916666664 | 36.12 |
| 44400.458333333336 | 35.65 |
| 44400.46875 | 32.16 |
| 44400.479166666664 | 33.29 |
| 44400.489583333336 | 28.55 |
| 44400.5 | 24.76 |
| 44400.510416666664 | 24.56 |
| 44400.520833333336 | 20.29 |
| 44400.53125 | 22.14 |
| 44400.541666666664 | 21.73 |
| 44400.552083333336 | 22.59 |
| 44400.5625 | 23.15 |
| 44400.572916666664 | 25.99 |
| 44400.583333333336 | 25.77 |
| 44400.59375 | 28.42 |
| 44400.604166666664 | 29.84 |
| 44400.614583333336 | 28.91 |
| 44400.625 | 30.45 |
| 44400.635416666664 | 32.65 |
| 44400.645833333336 | 39.53 |
| 44400.65625 | 42.47 |
| 44400.666666666664 | 42.91 |
| 44400.677083333336 | 44.39 |
| 44400.6875 | 38.97 |
| 44400.697916666664 | 46.42 |
| 44400.708333333336 | 43.26 |
| 44400.71875 | 41.46 |
| 44400.729166666664 | 35.49 |
| 44400.739583333336 | 39.79 |
| 44400.75 | 37.67 |
| 44400.760416666664 | 35.4 |
| 44400.770833333336 | 30.13 |
| 44400.78125 | 25.1 |
| 44400.791666666664 | 28.21 |
| 44400.802083333336 | 33.45 |
| 44400.8125 | 36.51 |
| 44400.822916666664 | 35.46 |
| 44400.833333333336 | 37.1 |
| 44400.84375 | 53.6 |
| 44400.854166666664 | 41.13 |
| 44400.864583333336 | 41.46 |
| 44400.875 | 42.99 |
| 44400.885416666664 | 45.94 |
| 44400.895833333336 | 52.8 |
| 44400.90625 | 46.65 |
| 44400.916666666664 | 48.76 |
| 44400.927083333336 | 50.63 |
| 44400.9375 | 49.54 |
| 44400.947916666664 | 46.86 |
| 44400.958333333336 | 45.51 |
| 44400.96875 | 44.38 |
| 44400.979166666664 | 41.05 |
| 44400.989583333336 | 39.05 |
| 44401.0 | 38.2 |
| 44401.010416666664 | 36.64 |
| 44401.020833333336 | 33.84 |
| 44401.03125 | 32.43 |
| 44401.041666666664 | 31.66 |
| 44401.052083333336 | 28.49 |
| 44401.0625 | 25.64 |
| 44401.072916666664 | 24.93 |
| 44401.083333333336 | 25.33 |
| 44401.09375 | 23.95 |
| 44401.104166666664 | 21.3 |
| 44401.114583333336 | 23.64 |
| 44401.125 | 24.98 |
| 44401.135416666664 | 24.38 |
| 44401.145833333336 | 28.61 |
| 44401.15625 | 25.34 |
| 44401.166666666664 | 34.49 |
| 44401.177083333336 | 37.19 |
| 44401.1875 | 34.25 |
| 44401.197916666664 | 35.03 |
| 44401.208333333336 | 25.63 |
| 44401.21875 | 50.38 |
| 44401.229166666664 | 50.94 |
| 44401.239583333336 | 46.17 |
| 44401.25 | 56.79 |
| 44401.260416666664 | 55.56 |
| 44401.270833333336 | 49.01 |
| 44401.28125 | 43.7 |
| 44401.291666666664 | 37.31 |
| 44401.302083333336 | 32.07 |
| 44401.3125 | 26.41 |
| 44401.322916666664 | 25.64 |
| 44401.333333333336 | 23.79 |
| 44401.34375 | 27.59 |
| 44401.354166666664 | 28.69 |
| 44401.364583333336 | 28.27 |
| 44401.375 | 49.23 |
| 44401.385416666664 | 34.68 |
| 44401.395833333336 | 50.76 |
| 44401.40625 | 37.65 |
| 44401.416666666664 | 36.27 |
| 44401.427083333336 | 36.64 |
| 44401.4375 | 36.44 |
| 44401.447916666664 | 36.98 |
| 44401.458333333336 | 35.94 |
| 44401.46875 | 35.36 |
| 44401.479166666664 | 36.47 |
| 44401.489583333336 | 35.68 |
| 44401.5 | 34.83 |
| 44401.510416666664 | 32.8 |
| 44401.520833333336 | 29.79 |
| 44401.53125 | 29.94 |
| 44401.541666666664 | 26.63 |
| 44401.552083333336 | 25.08 |
| 44401.5625 | 21.18 |
| 44401.572916666664 | 18.05 |
| 44401.583333333336 | 22.44 |
| 44401.59375 | 20.5 |
| 44401.604166666664 | 22.97 |
| 44401.614583333336 | 28.09 |
| 44401.625 | 28.93 |
| 44401.635416666664 | 29.65 |
| 44401.645833333336 | 32.47 |
| 44401.65625 | 32.64 |
| 44401.666666666664 | 36.32 |
| 44401.677083333336 | 36.21 |
| 44401.6875 | 39.89 |
| 44401.697916666664 | 48.55 |
| 44401.708333333336 | 44.85 |
| 44401.71875 | 40.85 |
| 44401.729166666664 | 44.07 |
| 44401.739583333336 | 39.17 |
| 44401.75 | 36.13 |
| 44401.760416666664 | 34.69 |
| 44401.770833333336 | 31.22 |
| 44401.78125 | 33.54 |
| 44401.791666666664 | 31.6 |
| 44401.802083333336 | 30.07 |
| 44401.8125 | 26.87 |
| 44401.822916666664 | 24.62 |
| 44401.833333333336 | 29.51 |
| 44401.84375 | 35.83 |
| 44401.854166666664 | 34.71 |
| 44401.864583333336 | 39.13 |
| 44401.875 | 40.28 |
| 44401.885416666664 | 44.67 |
| 44401.895833333336 | 52.57 |
| 44401.90625 | 57.5 |
| 44401.916666666664 | 52.59 |
| 44401.927083333336 | 58.05 |
| 44401.9375 | 53.61 |
| 44401.947916666664 | 56.31 |
| 44401.958333333336 | 56.87 |
| 44401.96875 | 55.06 |
| 44401.979166666664 | 57.04 |
| 44401.989583333336 | 55.52 |
| 44402.0 | 52.49 |
| 44402.010416666664 | 51.12 |
| 44402.020833333336 | 47.46 |
| 44402.03125 | 43.08 |
| 44402.041666666664 | 38.16 |
| 44402.052083333336 | 31.7 |
| 44402.06267361111 | 29.09 |
| 44402.072916666664 | 30.07 |
| 44402.083333333336 | 28.12 |
| 44402.09375 | 26.01 |
| 44402.104166666664 | 23.71 |
| 44402.114583333336 | 25.3 |
| 44402.125 | 26.93 |
| 44402.135416666664 | 21.62 |
| 44402.145833333336 | 21.71 |
| 44402.15625 | 20.68 |
| 44402.166666666664 | 23.29 |
| 44402.177083333336 | 24.54 |
| 44402.1875 | 27.3 |
| 44402.197916666664 | 28.24 |
| 44402.208333333336 | 29.88 |
| 44402.21875 | 32.87 |
| 44402.229166666664 | 35.42 |
| 44402.239583333336 | 36.6 |
| 44402.25 | 42.55 |
| 44402.260416666664 | 43.71 |
| 44402.270833333336 | 43.29 |
| 44402.28125 | 48.56 |
| 44402.291666666664 | 43.46 |
| 44402.302083333336 | 45.51 |
| 44402.3125 | 42.23 |
| 44402.322916666664 | 42.07 |
| 44402.333333333336 | 35.33 |
| 44402.34375 | 29.3 |
| 44402.354166666664 | 21.83 |
| 44402.364583333336 | 34.47 |
| 44402.375 | 27.64 |
| 44402.385416666664 | 31.17 |
| 44402.395833333336 | 32.65 |
| 44402.40625 | 34.16 |
| 44402.416666666664 | 37.87 |
| 44402.427083333336 | 43.58 |
| 44402.4375 | 50.78 |
| 44402.447916666664 | 50.27 |
| 44402.458333333336 | 53.44 |
| 44402.46875 | 54.54 |
| 44402.479166666664 | 55.16 |
| 44402.489583333336 | 52.73 |
| 44402.5 | 51.06 |
| 44402.510416666664 | 47.58 |
| 44402.520833333336 | 44.32 |
| 44402.53125 | 46.27 |
| 44402.541666666664 | 44.37 |
| 44402.552083333336 | 42.8 |
| 44402.5625 | 39.17 |
| 44402.572916666664 | 38.23 |
| 44402.583333333336 | 35.83 |
| 44402.59375 | 32.23 |
| 44402.604166666664 | 31.88 |
| 44402.614583333336 | 25.14 |
| 44402.625 | 23.61 |
| 44402.635416666664 | 24.45 |
| 44402.645833333336 | 23.37 |
| 44402.65625 | 28.81 |
| 44402.666666666664 | 35.53 |
| 44402.677083333336 | 38.33 |
| 44402.6875 | 43.22 |
| 44402.697916666664 | 44.42 |
| 44402.708333333336 | 41.44 |
| 44402.71875 | 41.59 |
| 44402.729166666664 | 42.99 |
| 44402.739583333336 | 40.73 |
| 44402.75 | 41.75 |
| 44402.760416666664 | 42.47 |
| 44402.770833333336 | 40.21 |
| 44402.78125 | 40.95 |
| 44402.791666666664 | 41.02 |
| 44402.802083333336 | 38.19 |
| 44402.8125 | 37.94 |
| 44402.822916666664 | 43.14 |
| 44402.833333333336 | 40.35 |
| 44402.84375 | 40.86 |
| 44402.854166666664 | 38.93 |
| 44402.864583333336 | 36.2 |
| 44402.875 | 34.56 |
| 44402.885416666664 | 42.15 |
| 44402.895833333336 | 42.41 |
| 44402.90625 | 46.26 |
| 44402.916666666664 | 58.07 |
| 44402.927083333336 | 70.82 |
| 44402.9375 | 88.34 |
| 44402.947916666664 | 103.14 |
| 44402.958333333336 | 113.04 |
| 44402.96875 | 118.23 |
| 44402.979166666664 | 122.44 |
| 44402.989583333336 | 119.8 |
| 44403.0 | 123.26 |
| 44403.010416666664 | 103.66 |
| 44403.020833333336 | 96.45 |
| 44403.03125 | 90.07 |
| 44403.041666666664 | 77.91 |
| 44403.052083333336 | 72.23 |
| 44403.0625 | 64.54 |
| 44403.072916666664 | 59.74 |
| 44403.083333333336 | 53.34 |
| 44403.09375 | 49.56 |
| 44403.104166666664 | 42.69 |
| 44403.114583333336 | 36.8 |
| 44403.125 | 36.97 |
| 44403.135416666664 | 29.68 |
| 44403.145833333336 | 30.33 |
| 44403.15625 | 27.13 |
| 44403.166666666664 | 24.22 |
| 44403.177083333336 | 22.32 |
| 44403.1875 | 22.51 |
| 44403.197916666664 | 27.37 |
| 44403.208333333336 | 29.79 |
| 44403.21875 | 28.25 |
| 44403.229166666664 | 37.93 |
| 44403.239583333336 | 38.87 |
| 44403.25 | 43.76 |
| 44403.260416666664 | 44.11 |
| 44403.270833333336 | 53.34 |
| 44403.28125 | 61.97 |
| 44403.291666666664 | 51.02 |
| 44403.302083333336 | 52.36 |
| 44403.3125 | 49.76 |
| 44403.322916666664 | 50.05 |
| 44403.333333333336 | 48.25 |
| 44403.34375 | 44.5 |
| 44403.354166666664 | 38.97 |
| 44403.364583333336 | 31.85 |
| 44403.375 | 28.84 |
| 44403.385416666664 | 29.55 |
| 44403.395833333336 | 32.8 |
| 44403.40625 | 31.71 |
| 44403.416666666664 | 35.24 |
| 44403.427083333336 | 34.31 |
| 44403.4375 | 35.2 |
| 44403.447916666664 | 36.59 |
| 44403.458333333336 | 46.81 |
| 44403.46875 | 52.74 |
| 44403.479166666664 | 54.73 |
| 44403.489583333336 | 53.53 |
| 44403.5 | 52.1 |
| 44403.510416666664 | 52.61 |
| 44403.520833333336 | 50.62 |
| 44403.53125 | 50.43 |
| 44403.541666666664 | 46.55 |
| 44403.552083333336 | 42.92 |
| 44403.5625 | 40.6 |
| 44403.572916666664 | 37.68 |
| 44403.583333333336 | 34.6 |
| 44403.59375 | 35.46 |
| 44403.604166666664 | 30.03 |
| 44403.614583333336 | 29.76 |
| 44403.625 | 28.03 |
| 44403.635416666664 | 20.62 |
| 44403.645833333336 | 25.52 |
| 44403.65625 | 16.39 |
| 44403.666666666664 | 17.31 |
| 44403.677083333336 | 20.87 |
| 44403.6875 | 24.21 |
| 44403.697916666664 | 22.88 |
| 44403.708333333336 | 34.19 |
| 44403.71875 | 41.75 |
| 44403.729166666664 | 48.56 |
| 44403.739583333336 | 35.75 |
| 44403.75 | 38.81 |
| 44403.760416666664 | 55.63 |
| 44403.770833333336 | 54.78 |
| 44403.78125 | 53.97 |
| 44403.791666666664 | 58.38 |
| 44403.802083333336 | 42.81 |
| 44403.8125 | 41.22 |
| 44403.822916666664 | 34.2 |
| 44403.833333333336 | 35.25 |
| 44403.84375 | 38.95 |
| 44403.854166666664 | 35.94 |
| 44403.864583333336 | 34.25 |
| 44403.875 | 29.87 |
| 44403.885416666664 | 29.97 |
| 44403.895833333336 | 27.08 |
| 44403.90625 | 33.53 |
| 44403.916666666664 | 38.99 |
| 44403.927083333336 | 38.09 |
| 44403.9375 | 43.92 |
| 44403.947916666664 | 44.35 |
| 44403.958333333336 | 48.04 |
| 44403.96875 | 55.33 |
| 44403.979166666664 | 53.77 |
| 44403.989583333336 | 54.52 |
| 44404.0 | 54.68 |
| 44404.010416666664 | 56.13 |
| 44404.020833333336 | 52.41 |
| 44404.03125 | 45.65 |
| 44404.041666666664 | 46.31 |
| 44404.052083333336 | 42.86 |
| 44404.0625 | 43 |
| 44404.072916666664 | 40.14 |
| 44404.083333333336 | 38.66 |
| 44404.09375 | 36.57 |
| 44404.104166666664 | 34.45 |
| 44404.114583333336 | 31.91 |
| 44404.125 | 31.26 |
| 44404.135416666664 | 27.72 |
| 44404.145833333336 | 27.78 |
| 44404.15625 | 25.83 |
| 44404.166666666664 | 23.28 |
| 44404.177083333336 | 22.94 |
| 44404.1875 | 21.32 |
| 44404.197916666664 | 21.47 |
| 44404.208333333336 | 22.51 |
| 44404.21875 | 24.58 |
| 44404.229166666664 | 26.2 |
| 44404.239583333336 | 27.95 |
| 44404.25 | 32.41 |
| 44404.260416666664 | 27.81 |
| 44404.270833333336 | 33.01 |
| 44404.28125 | 35.67 |
| 44404.291666666664 | 37.8 |
| 44404.302083333336 | 36.57 |
| 44404.3125 | 40.16 |
| 44404.322916666664 | 38 |
| 44404.333333333336 | 42.81 |
| 44404.34375 | 43.02 |
| 44404.354166666664 | 38.86 |
| 44404.364583333336 | 38.13 |
| 44404.375 | 33.49 |
| 44404.385416666664 | 32.77 |
| 44404.395833333336 | 25.39 |
| 44404.40625 | 23.22 |
| 44404.416666666664 | 21.58 |
| 44404.427083333336 | 23.74 |
| 44404.4375 | 25.35 |
| 44404.447916666664 | 27.75 |
| 44404.458333333336 | 29.25 |
| 44404.46875 | 31.14 |
| 44404.479166666664 | 31.76 |
| 44404.489583333336 | 32.44 |
| 44404.5 | 34.65 |
| 44404.510416666664 | 34.3 |
| 44404.520833333336 | 35.51 |
| 44404.53125 | 34.23 |
| 44404.541666666664 | 38.13 |
| 44404.552083333336 | 37.95 |
| 44404.5625 | 35.96 |
| 44404.572916666664 | 33.69 |
| 44404.583333333336 | 32.44 |
| 44404.59375 | 30.06 |
| 44404.604166666664 | 35.7 |
| 44404.614583333336 | 30.6 |
| 44404.625 | 30.32 |
| 44404.635416666664 | 29.25 |
| 44404.645833333336 | 22.63 |
| 44404.65625 | 21.81 |
| 44404.666666666664 | 21.23 |
| 44404.677083333336 | 18.64 |
| 44404.6875 | 17.98 |
| 44404.697916666664 | 18.54 |
| 44404.708333333336 | 15.76 |
| 44404.71875 | 19.87 |
| 44404.729166666664 | 23.75 |
| 44404.739583333336 | 24.52 |
| 44404.75 | 29.26 |
| 44404.760416666664 | 31.72 |
| 44404.770833333336 | 33.96 |
| 44404.78125 | 34.72 |
| 44404.791666666664 | 32.01 |
| 44404.802083333336 | 28.46 |
| 44404.8125 | 29.08 |
| 44404.822916666664 | 35.48 |
| 44404.833333333336 | 35.47 |
| 44404.84375 | 33.56 |
| 44404.854166666664 | 34.55 |
| 44404.864583333336 | 33.99 |
| 44404.875 | 32.1 |
| 44404.885416666664 | 30.57 |
| 44404.895833333336 | 32.02 |
| 44404.90625 | 29.23 |
| 44404.916666666664 | 28.11 |
| 44404.927083333336 | 27.02 |
| 44404.9375 | 27.34 |
| 44404.947916666664 | 29.07 |
| 44404.958333333336 | 33.2 |
| 44404.96875 | 36.02 |
| 44404.979166666664 | 36.92 |
| 44404.989583333336 | 41.29 |
| 44405.0 | 44.91 |
| 44405.010416666664 | 49.15 |
| 44405.020833333336 | 51.73 |
| 44405.03125 | 53.3 |
| 44405.041666666664 | 51.45 |
| 44405.052083333336 | 47.23 |
| 44405.0625 | 46.56 |
| 44405.072916666664 | 44.44 |
| 44405.083333333336 | 41.23 |
| 44405.09375 | 40.11 |
| 44405.104166666664 | 35.9 |
| 44405.114583333336 | 34.26 |
| 44405.125 | 34.49 |
| 44405.135416666664 | 31.77 |
| 44405.145833333336 | 28.93 |
| 44405.15625 | 29.19 |
| 44405.166666666664 | 26.02 |
| 44405.177083333336 | 26.35 |
| 44405.1875 | 24.2 |
| 44405.197916666664 | 22.44 |
| 44405.208333333336 | 27.5 |
| 44405.21875 | 24.08 |
| 44405.229166666664 | 24.25 |
| 44405.239583333336 | 25.82 |
| 44405.25 | 27.16 |
| 44405.260416666664 | 34.33 |
| 44405.270833333336 | 31.09 |
| 44405.28125 | 33.99 |
| 44405.291666666664 | 27.22 |
| 44405.302083333336 | 25.86 |
| 44405.3125 | 30.55 |
| 44405.322916666664 | 35.02 |
| 44405.333333333336 | 38.03 |
| 44405.34375 | 31.86 |
| 44405.354166666664 | 33.73 |
| 44405.364583333336 | 41 |
| 44405.375 | 38.65 |
| 44405.385416666664 | 37.84 |
| 44405.395833333336 | 30.49 |
| 44405.40625 | 30.59 |
| 44405.416666666664 | 29.85 |
| 44405.427083333336 | 29.44 |
| 44405.4375 | 28.15 |
| 44405.447916666664 | 28.51 |
| 44405.458333333336 | 25.98 |
| 44405.46875 | 25.15 |
| 44405.479166666664 | 28.46 |
| 44405.489583333336 | 27.75 |
| 44405.5 | 29.39 |
| 44405.510416666664 | 29.13 |
| 44405.520833333336 | 31.44 |
| 44405.53125 | 33.3 |
| 44405.541666666664 | 33.72 |
| 44405.552083333336 | 33.06 |
| 44405.5625 | 32.69 |
| 44405.572916666664 | 30.91 |
| 44405.583333333336 | 30.82 |
| 44405.59375 | 31.4 |
| 44405.604166666664 | 31.58 |
| 44405.614583333336 | 29.51 |
| 44405.625 | 28.8 |
| 44405.635416666664 | 28.56 |
| 44405.645833333336 | 27.87 |
| 44405.65625 | 28.91 |
| 44405.666666666664 | 28.18 |
| 44405.677083333336 | 25.47 |
| 44405.6875 | 21.62 |
| 44405.697916666664 | 25.96 |
| 44405.708333333336 | 20.02 |
| 44405.71875 | 19.68 |
| 44405.729166666664 | 18.6 |
| 44405.739583333336 | 16.78 |
| 44405.75 | 24.45 |
| 44405.760416666664 | 24.24 |
| 44405.770833333336 | 26.86 |
| 44405.78125 | 30.88 |
| 44405.791666666664 | 32.74 |
| 44405.802083333336 | 34.26 |
| 44405.8125 | 32.45 |
| 44405.822916666664 | 32.79 |
| 44405.833333333336 | 40.14 |
| 44405.84375 | 47.15 |
| 44405.854166666664 | 43.75 |
| 44405.864583333336 | 38.38 |
| 44405.875 | 34.88 |
| 44405.885416666664 | 37.7 |
| 44405.895833333336 | 32.11 |
| 44405.90625 | 32.18 |
| 44405.916666666664 | 30.83 |
| 44405.927083333336 | 26.89 |
| 44405.9375 | 27.08 |
| 44405.947916666664 | 25.69 |
| 44405.958333333336 | 25.63 |
| 44405.96875 | 24.96 |
| 44405.979166666664 | 27.12 |
| 44405.989583333336 | 28.16 |
| 44406.0 | 31.08 |
| 44406.010416666664 | 32.52 |
| 44406.020833333336 | 34.41 |
| 44406.03125 | 34.4 |
| 44406.041666666664 | 34.62 |
| 44406.052083333336 | 35.32 |
| 44406.0625 | 35.62 |
| 44406.072916666664 | 32.83 |
| 44406.083333333336 | 33.28 |
| 44406.09375 | 30.43 |
| 44406.104166666664 | 30.77 |
| 44406.114583333336 | 29.32 |
| 44406.125 | 30.01 |
| 44406.135416666664 | 28.37 |
| 44406.145833333336 | 27.39 |
| 44406.15625 | 26.15 |
| 44406.166666666664 | 24.98 |
| 44406.177083333336 | 24.03 |
| 44406.1875 | 24.4 |
| 44406.197916666664 | 25.39 |
| 44406.208333333336 | 22.8 |
| 44406.21875 | 22.08 |
| 44406.229166666664 | 21.48 |
| 44406.239583333336 | 22.39 |
| 44406.25 | 19.26 |
| 44406.260416666664 | 21.31 |
| 44406.270833333336 | 20.73 |
| 44406.28125 | 25.07 |
| 44406.291666666664 | 27.8 |
| 44406.302083333336 | 22 |
| 44406.3125 | 30.07 |
| 44406.322916666664 | 27.33 |
| 44406.333333333336 | 29.16 |
| 44406.34375 | 33.34 |
| 44406.354166666664 | 29.42 |
| 44406.364583333336 | 28.22 |
| 44406.375 | 27.86 |
| 44406.385416666664 | 28.15 |
| 44406.395833333336 | 27.4 |
| 44406.40625 | 28.89 |
| 44406.416666666664 | 30.61 |
| 44406.427083333336 | 30.2 |
| 44406.4375 | 24.41 |
| 44406.447916666664 | 25.57 |
| 44406.458333333336 | 22.43 |
| 44406.46875 | 20.97 |
| 44406.479166666664 | 20.16 |
| 44406.489583333336 | 20.99 |
| 44406.5 | 20.49 |
| 44406.510416666664 | 22.17 |
| 44406.520833333336 | 24.74 |
| 44406.53125 | 25.71 |
| 44406.541666666664 | 28.1 |
| 44406.552083333336 | 26.68 |
| 44406.5625 | 27.62 |
| 44406.572916666664 | 28.77 |
| 44406.583333333336 | 34.63 |
| 44406.59375 | 46.95 |
| 44406.604166666664 | 31.2 |
| 44406.614583333336 | 31.47 |
| 44406.625 | 29.35 |
| 44406.635416666664 | 28.03 |
| 44406.645833333336 | 29.4 |
| 44406.65625 | 26.21 |
| 44406.666666666664 | 26.14 |
| 44406.677083333336 | 23.68 |
| 44406.6875 | 22.8 |
| 44406.697916666664 | 23.17 |
| 44406.708333333336 | 21.51 |
| 44406.71875 | 20.5 |
| 44406.729166666664 | 21.6 |
| 44406.739583333336 | 17.83 |
| 44406.75 | 18.3 |
| 44406.760416666664 | 21.26 |
| 44406.770833333336 | 18.71 |
| 44406.78125 | 22.83 |
| 44406.791666666664 | 25.67 |
| 44406.802083333336 | 26.68 |
| 44406.8125 | 31.07 |
| 44406.822916666664 | 30.15 |
| 44406.833333333336 | 30.7 |
| 44406.84375 | 35.94 |
| 44406.854166666664 | 36.57 |
| 44406.864583333336 | 34.57 |
| 44406.875 | 34.25 |
| 44406.885416666664 | 33.86 |
| 44406.895833333336 | 35.47 |
| 44406.90625 | 35.74 |
| 44406.916666666664 | 33.64 |
| 44406.927083333336 | 35.8 |
| 44406.9375 | 35.49 |
| 44406.947916666664 | 35.64 |
| 44406.958333333336 | 32.81 |
| 44406.96875 | 33.96 |
| 44406.979166666664 | 32.9 |
| 44406.989583333336 | 27.22 |
| 44407.0 | 27.52 |
| 44407.010416666664 | 30.88 |
| 44407.020833333336 | 29.71 |
| 44407.03125 | 33.96 |
| 44407.041666666664 | 34.58 |
| 44407.052083333336 | 33.73 |
| 44407.0625 | 34.11 |
| 44407.072916666664 | 32.73 |
| 44407.083333333336 | 33.05 |
| 44407.09375 | 32.04 |
| 44407.104166666664 | 33.2 |
| 44407.114583333336 | 33.15 |
| 44407.125 | 35.97 |
| 44407.135416666664 | 32.77 |
| 44407.145833333336 | 31.29 |
| 44407.15625 | 28.78 |
| 44407.166666666664 | 30.57 |
| 44407.177083333336 | 28.48 |
| 44407.1875 | 27.3 |
| 44407.197916666664 | 25.91 |
| 44407.208333333336 | 24.11 |
| 44407.21875 | 24.05 |
| 44407.229166666664 | 22.94 |
| 44407.239583333336 | 21.45 |
| 44407.25 | 20.42 |
| 44407.260416666664 | 19.49 |
| 44407.270833333336 | 20.77 |
| 44407.28125 | 21.45 |
| 44407.291666666664 | 23.27 |
| 44407.302083333336 | 21.79 |
| 44407.3125 | 30.69 |
| 44407.322916666664 | 30.15 |
| 44407.333333333336 | 32.64 |
| 44407.34375 | 24.35 |
| 44407.354166666664 | 28.03 |
| 44407.364583333336 | 32.11 |
| 44407.375 | 31.61 |
| 44407.385416666664 | 26.05 |
| 44407.395833333336 | 26.85 |
| 44407.40625 | 30.02 |
| 44407.416666666664 | 31.47 |
| 44407.427083333336 | 26.45 |
| 44407.4375 | 25.01 |
| 44407.447916666664 | 26.86 |
| 44407.458333333336 | 27.16 |
| 44407.46875 | 27.79 |
| 44407.479166666664 | 27.15 |
| 44407.489583333336 | 28.1 |
| 44407.5 | 27.27 |
| 44407.510416666664 | 24.61 |
| 44407.520833333336 | 27.64 |
| 44407.53125 | 29.25 |
| 44407.541666666664 | 31.71 |
| 44407.552083333336 | 31.74 |
| 44407.5625 | 29.53 |
| 44407.572916666664 | 28.77 |
| 44407.583333333336 | 31.15 |
| 44407.59375 | 32.67 |
| 44407.604166666664 | 32.37 |
| 44407.614583333336 | 32.63 |
| 44407.625 | 31.28 |
| 44407.635416666664 | 32.53 |
| 44407.645833333336 | 30.71 |
| 44407.65625 | 29.36 |
| 44407.666666666664 | 30.17 |
| 44407.677083333336 | 26 |
| 44407.6875 | 25.61 |
| 44407.697916666664 | 26.46 |
| 44407.708333333336 | 25.5 |
| 44407.71875 | 26.68 |
| 44407.729166666664 | 22.47 |
| 44407.739583333336 | 23.71 |
| 44407.75 | 22.34 |
| 44407.760416666664 | 21.48 |
| 44407.770833333336 | 19.13 |
| 44407.78125 | 16.43 |
| 44407.791666666664 | 19.7 |
| 44407.802083333336 | 15.78 |
| 44407.8125 | 17.02 |
| 44407.822916666664 | 18.72 |
| 44407.833333333336 | 22.05 |
| 44407.84375 | 26.19 |
| 44407.854166666664 | 31.55 |
| 44407.864583333336 | 33.33 |
| 44407.875 | 33.56 |
| 44407.885416666664 | 34.56 |
| 44407.895833333336 | 30.85 |
| 44407.90625 | 28.08 |
| 44407.916666666664 | 38.24 |
| 44407.927083333336 | 36.91 |
| 44407.9375 | 39.26 |
| 44407.947916666664 | 37.22 |
| 44407.958333333336 | 37.2 |
| 44407.96875 | 36.51 |
| 44407.979166666664 | 36.07 |
| 44407.989583333336 | 34.76 |
| 44408.0 | 30.78 |
| 44408.010416666664 | 31.64 |
| 44408.020833333336 | 28.62 |
| 44408.03125 | 23.58 |
| 44408.041666666664 | 24.79 |
| 44408.052083333336 | 29.89 |
| 44408.0625 | 35.35 |
| 44408.072916666664 | 31.69 |
| 44408.083333333336 | 30.92 |
| 44408.09375 | 31.16 |
| 44408.104166666664 | 28.63 |
| 44408.114583333336 | 28.35 |
| 44408.125 | 28.53 |
| 44408.135416666664 | 27.94 |
| 44408.145833333336 | 24.58 |
| 44408.15625 | 22.99 |